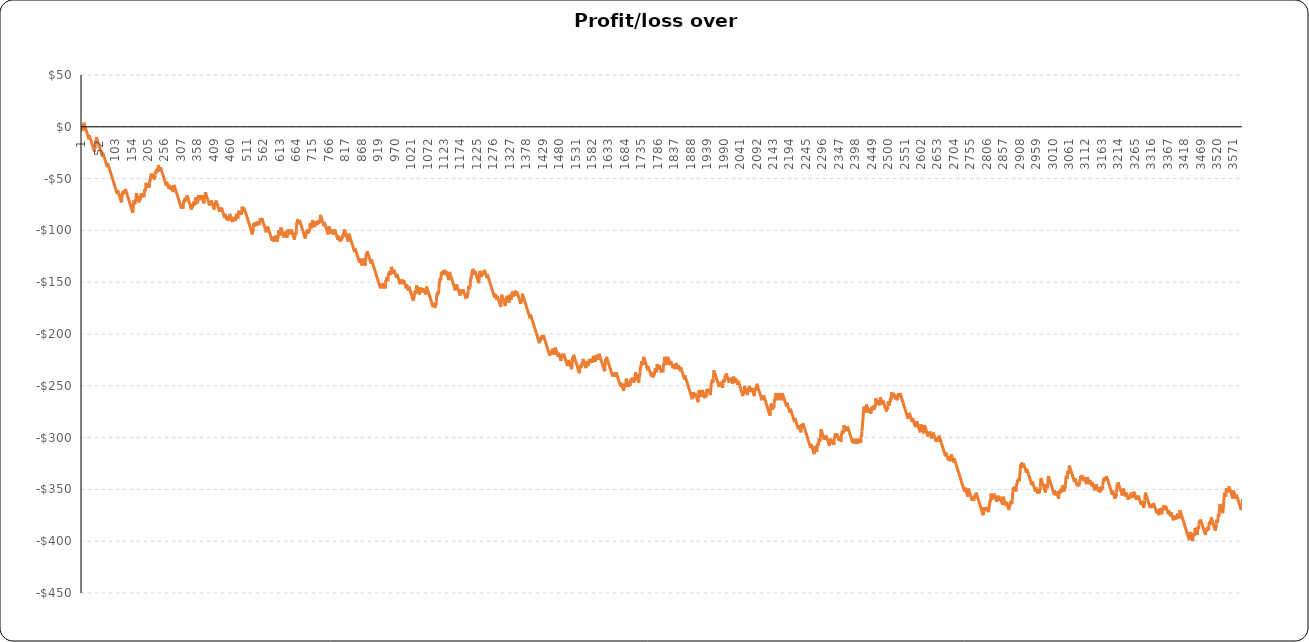
| Category | Running total  |
|---|---|
| 1.0 | -1 |
| 2.0 | -2 |
| 3.0 | -3 |
| 4.0 | -4 |
| 5.0 | 0 |
| 6.0 | 4 |
| 7.0 | 3 |
| 8.0 | 2 |
| 9.0 | 1 |
| 10.0 | 0 |
| 11.0 | -1 |
| 12.0 | -2 |
| 13.0 | -3 |
| 14.0 | -4 |
| 15.0 | -5 |
| 16.0 | -6 |
| 17.0 | -7 |
| 18.0 | -8 |
| 19.0 | -9 |
| 20.0 | -10 |
| 21.0 | -11 |
| 22.0 | -12 |
| 23.0 | -8 |
| 24.0 | -9 |
| 25.0 | -10 |
| 26.0 | -11 |
| 27.0 | -12 |
| 28.0 | -13 |
| 29.0 | -14 |
| 30.0 | -15 |
| 31.0 | -16 |
| 32.0 | -17 |
| 33.0 | -18 |
| 34.0 | -19 |
| 35.0 | -20 |
| 36.0 | -21 |
| 37.0 | -22 |
| 38.0 | -23 |
| 39.0 | -24 |
| 40.0 | -20 |
| 41.0 | -21 |
| 42.0 | -17 |
| 43.0 | -13 |
| 44.0 | -14 |
| 45.0 | -10 |
| 46.0 | -11 |
| 47.0 | -12 |
| 48.0 | -13 |
| 49.0 | -14 |
| 50.0 | -15 |
| 51.0 | -16 |
| 52.0 | -17 |
| 53.0 | -18 |
| 54.0 | -19 |
| 55.0 | -20 |
| 56.0 | -21 |
| 57.0 | -22 |
| 58.0 | -23 |
| 59.0 | -24 |
| 60.0 | -25 |
| 61.0 | -26 |
| 62.0 | -27 |
| 63.0 | -28 |
| 64.0 | -29 |
| 65.0 | -25 |
| 66.0 | -26 |
| 67.0 | -27 |
| 68.0 | -28 |
| 69.0 | -29 |
| 70.0 | -30 |
| 71.0 | -31 |
| 72.0 | -32 |
| 73.0 | -33 |
| 74.0 | -34 |
| 75.0 | -35 |
| 76.0 | -36 |
| 77.0 | -37 |
| 78.0 | -38 |
| 79.0 | -39 |
| 80.0 | -35 |
| 81.0 | -36 |
| 82.0 | -37 |
| 83.0 | -38 |
| 84.0 | -39 |
| 85.0 | -40 |
| 86.0 | -41 |
| 87.0 | -42 |
| 88.0 | -43 |
| 89.0 | -44 |
| 90.0 | -45 |
| 91.0 | -46 |
| 92.0 | -47 |
| 93.0 | -48 |
| 94.0 | -49 |
| 95.0 | -50 |
| 96.0 | -51 |
| 97.0 | -52 |
| 98.0 | -53 |
| 99.0 | -54 |
| 100.0 | -55 |
| 101.0 | -56 |
| 102.0 | -57 |
| 103.0 | -58 |
| 104.0 | -59 |
| 105.0 | -60 |
| 106.0 | -61 |
| 107.0 | -62 |
| 108.0 | -63 |
| 109.0 | -64 |
| 110.0 | -65 |
| 111.0 | -61 |
| 112.0 | -62 |
| 113.0 | -63 |
| 114.0 | -64 |
| 115.0 | -65 |
| 116.0 | -66 |
| 117.0 | -67 |
| 118.0 | -68 |
| 119.0 | -69 |
| 120.0 | -70 |
| 121.0 | -71 |
| 122.0 | -72 |
| 123.0 | -73 |
| 124.0 | -69 |
| 125.0 | -65 |
| 126.0 | -66 |
| 127.0 | -62 |
| 128.0 | -63 |
| 129.0 | -64 |
| 130.0 | -65 |
| 131.0 | -61 |
| 132.0 | -62 |
| 133.0 | -63 |
| 134.0 | -64 |
| 135.0 | -60 |
| 136.0 | -61 |
| 137.0 | -62 |
| 138.0 | -63 |
| 139.0 | -64 |
| 140.0 | -65 |
| 141.0 | -66 |
| 142.0 | -67 |
| 143.0 | -68 |
| 144.0 | -69 |
| 145.0 | -70 |
| 146.0 | -71 |
| 147.0 | -72 |
| 148.0 | -73 |
| 149.0 | -74 |
| 150.0 | -75 |
| 151.0 | -76 |
| 152.0 | -77 |
| 153.0 | -78 |
| 154.0 | -79 |
| 155.0 | -80 |
| 156.0 | -81 |
| 157.0 | -82 |
| 158.0 | -83 |
| 159.0 | -79 |
| 160.0 | -75 |
| 161.0 | -71 |
| 162.0 | -72 |
| 163.0 | -73 |
| 164.0 | -74 |
| 165.0 | -75 |
| 166.0 | -71 |
| 167.0 | -72 |
| 168.0 | -68 |
| 169.0 | -64 |
| 170.0 | -65 |
| 171.0 | -66 |
| 172.0 | -67 |
| 173.0 | -68 |
| 174.0 | -69 |
| 175.0 | -70 |
| 176.0 | -71 |
| 177.0 | -72 |
| 178.0 | -73 |
| 179.0 | -69 |
| 180.0 | -70 |
| 181.0 | -71 |
| 182.0 | -67 |
| 183.0 | -68 |
| 184.0 | -64 |
| 185.0 | -65 |
| 186.0 | -66 |
| 187.0 | -67 |
| 188.0 | -68 |
| 189.0 | -64 |
| 190.0 | -65 |
| 191.0 | -66 |
| 192.0 | -67 |
| 193.0 | -68 |
| 194.0 | -64 |
| 195.0 | -60 |
| 196.0 | -61 |
| 197.0 | -62 |
| 198.0 | -58 |
| 199.0 | -54 |
| 200.0 | -55 |
| 201.0 | -56 |
| 202.0 | -57 |
| 203.0 | -58 |
| 204.0 | -59 |
| 205.0 | -55 |
| 206.0 | -56 |
| 207.0 | -57 |
| 208.0 | -58 |
| 209.0 | -59 |
| 210.0 | -55 |
| 211.0 | -51 |
| 212.0 | -52 |
| 213.0 | -48 |
| 214.0 | -49 |
| 215.0 | -45 |
| 216.0 | -46 |
| 217.0 | -47 |
| 218.0 | -48 |
| 219.0 | -49 |
| 220.0 | -50 |
| 221.0 | -46 |
| 222.0 | -47 |
| 223.0 | -48 |
| 224.0 | -49 |
| 225.0 | -50 |
| 226.0 | -51 |
| 227.0 | -47 |
| 228.0 | -43 |
| 229.0 | -44 |
| 230.0 | -45 |
| 231.0 | -41 |
| 232.0 | -42 |
| 233.0 | -43 |
| 234.0 | -44 |
| 235.0 | -40 |
| 236.0 | -41 |
| 237.0 | -37 |
| 238.0 | -38 |
| 239.0 | -39 |
| 240.0 | -40 |
| 241.0 | -41 |
| 242.0 | -42 |
| 243.0 | -43 |
| 244.0 | -39 |
| 245.0 | -40 |
| 246.0 | -41 |
| 247.0 | -42 |
| 248.0 | -43 |
| 249.0 | -44 |
| 250.0 | -45 |
| 251.0 | -46 |
| 252.0 | -47 |
| 253.0 | -48 |
| 254.0 | -49 |
| 255.0 | -50 |
| 256.0 | -51 |
| 257.0 | -52 |
| 258.0 | -53 |
| 259.0 | -54 |
| 260.0 | -55 |
| 261.0 | -56 |
| 262.0 | -57 |
| 263.0 | -53 |
| 264.0 | -54 |
| 265.0 | -55 |
| 266.0 | -56 |
| 267.0 | -57 |
| 268.0 | -58 |
| 269.0 | -59 |
| 270.0 | -60 |
| 271.0 | -56 |
| 272.0 | -57 |
| 273.0 | -58 |
| 274.0 | -59 |
| 275.0 | -60 |
| 276.0 | -61 |
| 277.0 | -57 |
| 278.0 | -58 |
| 279.0 | -59 |
| 280.0 | -60 |
| 281.0 | -61 |
| 282.0 | -62 |
| 283.0 | -63 |
| 284.0 | -59 |
| 285.0 | -60 |
| 286.0 | -56 |
| 287.0 | -57 |
| 288.0 | -58 |
| 289.0 | -59 |
| 290.0 | -60 |
| 291.0 | -61 |
| 292.0 | -62 |
| 293.0 | -63 |
| 294.0 | -64 |
| 295.0 | -65 |
| 296.0 | -66 |
| 297.0 | -67 |
| 298.0 | -68 |
| 299.0 | -69 |
| 300.0 | -70 |
| 301.0 | -71 |
| 302.0 | -72 |
| 303.0 | -73 |
| 304.0 | -74 |
| 305.0 | -75 |
| 306.0 | -76 |
| 307.0 | -77 |
| 308.0 | -78 |
| 309.0 | -79 |
| 310.0 | -75 |
| 311.0 | -76 |
| 312.0 | -77 |
| 313.0 | -78 |
| 314.0 | -79 |
| 315.0 | -75 |
| 316.0 | -71 |
| 317.0 | -72 |
| 318.0 | -73 |
| 319.0 | -69 |
| 320.0 | -70 |
| 321.0 | -71 |
| 322.0 | -72 |
| 323.0 | -68 |
| 324.0 | -69 |
| 325.0 | -70 |
| 326.0 | -66 |
| 327.0 | -67 |
| 328.0 | -68 |
| 329.0 | -69 |
| 330.0 | -70 |
| 331.0 | -71 |
| 332.0 | -72 |
| 333.0 | -73 |
| 334.0 | -74 |
| 335.0 | -75 |
| 336.0 | -76 |
| 337.0 | -77 |
| 338.0 | -78 |
| 339.0 | -79 |
| 340.0 | -80 |
| 341.0 | -76 |
| 342.0 | -77 |
| 343.0 | -78 |
| 344.0 | -74 |
| 345.0 | -75 |
| 346.0 | -76 |
| 347.0 | -72 |
| 348.0 | -73 |
| 349.0 | -74 |
| 350.0 | -75 |
| 351.0 | -76 |
| 352.0 | -72 |
| 353.0 | -68 |
| 354.0 | -69 |
| 355.0 | -70 |
| 356.0 | -71 |
| 357.0 | -72 |
| 358.0 | -73 |
| 359.0 | -74 |
| 360.0 | -70 |
| 361.0 | -66 |
| 362.0 | -67 |
| 363.0 | -68 |
| 364.0 | -69 |
| 365.0 | -70 |
| 366.0 | -71 |
| 367.0 | -67 |
| 368.0 | -68 |
| 369.0 | -69 |
| 370.0 | -70 |
| 371.0 | -66 |
| 372.0 | -67 |
| 373.0 | -68 |
| 374.0 | -69 |
| 375.0 | -70 |
| 376.0 | -71 |
| 377.0 | -72 |
| 378.0 | -73 |
| 379.0 | -74 |
| 380.0 | -70 |
| 381.0 | -66 |
| 382.0 | -67 |
| 383.0 | -63 |
| 384.0 | -64 |
| 385.0 | -65 |
| 386.0 | -66 |
| 387.0 | -67 |
| 388.0 | -68 |
| 389.0 | -69 |
| 390.0 | -70 |
| 391.0 | -71 |
| 392.0 | -72 |
| 393.0 | -73 |
| 394.0 | -74 |
| 395.0 | -75 |
| 396.0 | -76 |
| 397.0 | -72 |
| 398.0 | -73 |
| 399.0 | -74 |
| 400.0 | -75 |
| 401.0 | -71 |
| 402.0 | -72 |
| 403.0 | -73 |
| 404.0 | -74 |
| 405.0 | -75 |
| 406.0 | -76 |
| 407.0 | -77 |
| 408.0 | -78 |
| 409.0 | -79 |
| 410.0 | -80 |
| 411.0 | -76 |
| 412.0 | -77 |
| 413.0 | -73 |
| 414.0 | -74 |
| 415.0 | -75 |
| 416.0 | -71 |
| 417.0 | -72 |
| 418.0 | -73 |
| 419.0 | -74 |
| 420.0 | -75 |
| 421.0 | -76 |
| 422.0 | -77 |
| 423.0 | -78 |
| 424.0 | -79 |
| 425.0 | -80 |
| 426.0 | -81 |
| 427.0 | -82 |
| 428.0 | -78 |
| 429.0 | -79 |
| 430.0 | -80 |
| 431.0 | -81 |
| 432.0 | -82 |
| 433.0 | -78 |
| 434.0 | -79 |
| 435.0 | -80 |
| 436.0 | -81 |
| 437.0 | -82 |
| 438.0 | -83 |
| 439.0 | -84 |
| 440.0 | -85 |
| 441.0 | -86 |
| 442.0 | -87 |
| 443.0 | -88 |
| 444.0 | -84 |
| 445.0 | -85 |
| 446.0 | -86 |
| 447.0 | -87 |
| 448.0 | -88 |
| 449.0 | -89 |
| 450.0 | -90 |
| 451.0 | -86 |
| 452.0 | -87 |
| 453.0 | -88 |
| 454.0 | -89 |
| 455.0 | -90 |
| 456.0 | -91 |
| 457.0 | -87 |
| 458.0 | -88 |
| 459.0 | -84 |
| 460.0 | -85 |
| 461.0 | -86 |
| 462.0 | -87 |
| 463.0 | -88 |
| 464.0 | -89 |
| 465.0 | -90 |
| 466.0 | -91 |
| 467.0 | -92 |
| 468.0 | -88 |
| 469.0 | -89 |
| 470.0 | -90 |
| 471.0 | -91 |
| 472.0 | -87 |
| 473.0 | -88 |
| 474.0 | -89 |
| 475.0 | -90 |
| 476.0 | -91 |
| 477.0 | -87 |
| 478.0 | -88 |
| 479.0 | -84 |
| 480.0 | -85 |
| 481.0 | -86 |
| 482.0 | -87 |
| 483.0 | -88 |
| 484.0 | -89 |
| 485.0 | -85 |
| 486.0 | -81 |
| 487.0 | -82 |
| 488.0 | -83 |
| 489.0 | -84 |
| 490.0 | -85 |
| 491.0 | -81 |
| 492.0 | -82 |
| 493.0 | -83 |
| 494.0 | -84 |
| 495.0 | -85 |
| 496.0 | -81 |
| 497.0 | -77 |
| 498.0 | -78 |
| 499.0 | -79 |
| 500.0 | -80 |
| 501.0 | -81 |
| 502.0 | -82 |
| 503.0 | -78 |
| 504.0 | -79 |
| 505.0 | -80 |
| 506.0 | -81 |
| 507.0 | -82 |
| 508.0 | -83 |
| 509.0 | -84 |
| 510.0 | -85 |
| 511.0 | -86 |
| 512.0 | -87 |
| 513.0 | -88 |
| 514.0 | -89 |
| 515.0 | -90 |
| 516.0 | -91 |
| 517.0 | -92 |
| 518.0 | -93 |
| 519.0 | -94 |
| 520.0 | -95 |
| 521.0 | -96 |
| 522.0 | -97 |
| 523.0 | -98 |
| 524.0 | -99 |
| 525.0 | -100 |
| 526.0 | -101 |
| 527.0 | -102 |
| 528.0 | -103 |
| 529.0 | -104 |
| 530.0 | -100 |
| 531.0 | -101 |
| 532.0 | -97 |
| 533.0 | -93 |
| 534.0 | -94 |
| 535.0 | -95 |
| 536.0 | -96 |
| 537.0 | -92 |
| 538.0 | -93 |
| 539.0 | -94 |
| 540.0 | -95 |
| 541.0 | -96 |
| 542.0 | -92 |
| 543.0 | -93 |
| 544.0 | -94 |
| 545.0 | -95 |
| 546.0 | -91 |
| 547.0 | -92 |
| 548.0 | -93 |
| 549.0 | -94 |
| 550.0 | -95 |
| 551.0 | -91 |
| 552.0 | -92 |
| 553.0 | -88 |
| 554.0 | -89 |
| 555.0 | -90 |
| 556.0 | -91 |
| 557.0 | -92 |
| 558.0 | -88 |
| 559.0 | -89 |
| 560.0 | -90 |
| 561.0 | -91 |
| 562.0 | -92 |
| 563.0 | -93 |
| 564.0 | -94 |
| 565.0 | -95 |
| 566.0 | -96 |
| 567.0 | -97 |
| 568.0 | -98 |
| 569.0 | -99 |
| 570.0 | -100 |
| 571.0 | -101 |
| 572.0 | -102 |
| 573.0 | -98 |
| 574.0 | -99 |
| 575.0 | -100 |
| 576.0 | -96 |
| 577.0 | -97 |
| 578.0 | -98 |
| 579.0 | -99 |
| 580.0 | -100 |
| 581.0 | -101 |
| 582.0 | -102 |
| 583.0 | -103 |
| 584.0 | -104 |
| 585.0 | -105 |
| 586.0 | -106 |
| 587.0 | -107 |
| 588.0 | -108 |
| 589.0 | -109 |
| 590.0 | -110 |
| 591.0 | -106 |
| 592.0 | -107 |
| 593.0 | -108 |
| 594.0 | -109 |
| 595.0 | -110 |
| 596.0 | -111 |
| 597.0 | -107 |
| 598.0 | -108 |
| 599.0 | -109 |
| 600.0 | -105 |
| 601.0 | -106 |
| 602.0 | -107 |
| 603.0 | -108 |
| 604.0 | -109 |
| 605.0 | -110 |
| 606.0 | -111 |
| 607.0 | -107 |
| 608.0 | -108 |
| 609.0 | -104 |
| 610.0 | -100 |
| 611.0 | -101 |
| 612.0 | -102 |
| 613.0 | -103 |
| 614.0 | -104 |
| 615.0 | -105 |
| 616.0 | -101 |
| 617.0 | -97 |
| 618.0 | -98 |
| 619.0 | -99 |
| 620.0 | -100 |
| 621.0 | -101 |
| 622.0 | -102 |
| 623.0 | -103 |
| 624.0 | -104 |
| 625.0 | -105 |
| 626.0 | -106 |
| 627.0 | -107 |
| 628.0 | -103 |
| 629.0 | -104 |
| 630.0 | -105 |
| 631.0 | -101 |
| 632.0 | -102 |
| 633.0 | -103 |
| 634.0 | -104 |
| 635.0 | -105 |
| 636.0 | -106 |
| 637.0 | -107 |
| 638.0 | -103 |
| 639.0 | -99 |
| 640.0 | -100 |
| 641.0 | -101 |
| 642.0 | -102 |
| 643.0 | -103 |
| 644.0 | -104 |
| 645.0 | -100 |
| 646.0 | -101 |
| 647.0 | -102 |
| 648.0 | -103 |
| 649.0 | -99 |
| 650.0 | -100 |
| 651.0 | -101 |
| 652.0 | -102 |
| 653.0 | -103 |
| 654.0 | -104 |
| 655.0 | -105 |
| 656.0 | -106 |
| 657.0 | -107 |
| 658.0 | -108 |
| 659.0 | -109 |
| 660.0 | -105 |
| 661.0 | -106 |
| 662.0 | -102 |
| 663.0 | -103 |
| 664.0 | -104 |
| 665.0 | -100 |
| 666.0 | -96 |
| 667.0 | -92 |
| 668.0 | -93 |
| 669.0 | -89 |
| 670.0 | -90 |
| 671.0 | -91 |
| 672.0 | -92 |
| 673.0 | -93 |
| 674.0 | -94 |
| 675.0 | -90 |
| 676.0 | -91 |
| 677.0 | -92 |
| 678.0 | -93 |
| 679.0 | -94 |
| 680.0 | -95 |
| 681.0 | -96 |
| 682.0 | -97 |
| 683.0 | -98 |
| 684.0 | -99 |
| 685.0 | -100 |
| 686.0 | -101 |
| 687.0 | -102 |
| 688.0 | -103 |
| 689.0 | -104 |
| 690.0 | -105 |
| 691.0 | -106 |
| 692.0 | -107 |
| 693.0 | -108 |
| 694.0 | -104 |
| 695.0 | -105 |
| 696.0 | -101 |
| 697.0 | -102 |
| 698.0 | -103 |
| 699.0 | -99 |
| 700.0 | -100 |
| 701.0 | -101 |
| 702.0 | -102 |
| 703.0 | -103 |
| 704.0 | -99 |
| 705.0 | -100 |
| 706.0 | -101 |
| 707.0 | -97 |
| 708.0 | -93 |
| 709.0 | -94 |
| 710.0 | -95 |
| 711.0 | -96 |
| 712.0 | -97 |
| 713.0 | -98 |
| 714.0 | -94 |
| 715.0 | -90 |
| 716.0 | -91 |
| 717.0 | -92 |
| 718.0 | -93 |
| 719.0 | -94 |
| 720.0 | -95 |
| 721.0 | -96 |
| 722.0 | -97 |
| 723.0 | -93 |
| 724.0 | -94 |
| 725.0 | -95 |
| 726.0 | -91 |
| 727.0 | -92 |
| 728.0 | -93 |
| 729.0 | -94 |
| 730.0 | -95 |
| 731.0 | -91 |
| 732.0 | -92 |
| 733.0 | -93 |
| 734.0 | -94 |
| 735.0 | -90 |
| 736.0 | -91 |
| 737.0 | -92 |
| 738.0 | -93 |
| 739.0 | -89 |
| 740.0 | -85 |
| 741.0 | -86 |
| 742.0 | -87 |
| 743.0 | -88 |
| 744.0 | -89 |
| 745.0 | -90 |
| 746.0 | -91 |
| 747.0 | -92 |
| 748.0 | -93 |
| 749.0 | -94 |
| 750.0 | -95 |
| 751.0 | -96 |
| 752.0 | -92 |
| 753.0 | -93 |
| 754.0 | -94 |
| 755.0 | -95 |
| 756.0 | -96 |
| 757.0 | -97 |
| 758.0 | -98 |
| 759.0 | -99 |
| 760.0 | -100 |
| 761.0 | -101 |
| 762.0 | -102 |
| 763.0 | -103 |
| 764.0 | -104 |
| 765.0 | -100 |
| 766.0 | -96 |
| 767.0 | -97 |
| 768.0 | -98 |
| 769.0 | -99 |
| 770.0 | -100 |
| 771.0 | -101 |
| 772.0 | -102 |
| 773.0 | -103 |
| 774.0 | -99 |
| 775.0 | -100 |
| 776.0 | -101 |
| 777.0 | -102 |
| 778.0 | -103 |
| 779.0 | -104 |
| 780.0 | -100 |
| 781.0 | -101 |
| 782.0 | -102 |
| 783.0 | -103 |
| 784.0 | -99 |
| 785.0 | -100 |
| 786.0 | -101 |
| 787.0 | -102 |
| 788.0 | -103 |
| 789.0 | -104 |
| 790.0 | -105 |
| 791.0 | -106 |
| 792.0 | -107 |
| 793.0 | -108 |
| 794.0 | -109 |
| 795.0 | -105 |
| 796.0 | -106 |
| 797.0 | -107 |
| 798.0 | -108 |
| 799.0 | -109 |
| 800.0 | -110 |
| 801.0 | -111 |
| 802.0 | -107 |
| 803.0 | -108 |
| 804.0 | -109 |
| 805.0 | -110 |
| 806.0 | -106 |
| 807.0 | -107 |
| 808.0 | -108 |
| 809.0 | -104 |
| 810.0 | -105 |
| 811.0 | -106 |
| 812.0 | -102 |
| 813.0 | -103 |
| 814.0 | -99 |
| 815.0 | -100 |
| 816.0 | -101 |
| 817.0 | -102 |
| 818.0 | -103 |
| 819.0 | -104 |
| 820.0 | -105 |
| 821.0 | -106 |
| 822.0 | -107 |
| 823.0 | -108 |
| 824.0 | -109 |
| 825.0 | -110 |
| 826.0 | -111 |
| 827.0 | -107 |
| 828.0 | -103 |
| 829.0 | -104 |
| 830.0 | -105 |
| 831.0 | -106 |
| 832.0 | -107 |
| 833.0 | -108 |
| 834.0 | -109 |
| 835.0 | -110 |
| 836.0 | -111 |
| 837.0 | -112 |
| 838.0 | -113 |
| 839.0 | -114 |
| 840.0 | -115 |
| 841.0 | -116 |
| 842.0 | -117 |
| 843.0 | -118 |
| 844.0 | -119 |
| 845.0 | -120 |
| 846.0 | -121 |
| 847.0 | -117 |
| 848.0 | -118 |
| 849.0 | -119 |
| 850.0 | -120 |
| 851.0 | -121 |
| 852.0 | -122 |
| 853.0 | -123 |
| 854.0 | -124 |
| 855.0 | -125 |
| 856.0 | -126 |
| 857.0 | -127 |
| 858.0 | -128 |
| 859.0 | -129 |
| 860.0 | -130 |
| 861.0 | -131 |
| 862.0 | -127 |
| 863.0 | -128 |
| 864.0 | -129 |
| 865.0 | -130 |
| 866.0 | -131 |
| 867.0 | -132 |
| 868.0 | -133 |
| 869.0 | -134 |
| 870.0 | -130 |
| 871.0 | -131 |
| 872.0 | -127 |
| 873.0 | -128 |
| 874.0 | -129 |
| 875.0 | -130 |
| 876.0 | -131 |
| 877.0 | -132 |
| 878.0 | -133 |
| 879.0 | -134 |
| 880.0 | -130 |
| 881.0 | -126 |
| 882.0 | -122 |
| 883.0 | -123 |
| 884.0 | -124 |
| 885.0 | -120 |
| 886.0 | -121 |
| 887.0 | -122 |
| 888.0 | -123 |
| 889.0 | -124 |
| 890.0 | -125 |
| 891.0 | -126 |
| 892.0 | -127 |
| 893.0 | -128 |
| 894.0 | -129 |
| 895.0 | -130 |
| 896.0 | -131 |
| 897.0 | -132 |
| 898.0 | -128 |
| 899.0 | -129 |
| 900.0 | -130 |
| 901.0 | -131 |
| 902.0 | -132 |
| 903.0 | -133 |
| 904.0 | -134 |
| 905.0 | -135 |
| 906.0 | -136 |
| 907.0 | -137 |
| 908.0 | -138 |
| 909.0 | -139 |
| 910.0 | -140 |
| 911.0 | -141 |
| 912.0 | -142 |
| 913.0 | -143 |
| 914.0 | -144 |
| 915.0 | -145 |
| 916.0 | -146 |
| 917.0 | -147 |
| 918.0 | -148 |
| 919.0 | -149 |
| 920.0 | -150 |
| 921.0 | -151 |
| 922.0 | -152 |
| 923.0 | -153 |
| 924.0 | -154 |
| 925.0 | -155 |
| 926.0 | -156 |
| 927.0 | -152 |
| 928.0 | -153 |
| 929.0 | -154 |
| 930.0 | -155 |
| 931.0 | -151 |
| 932.0 | -152 |
| 933.0 | -153 |
| 934.0 | -154 |
| 935.0 | -155 |
| 936.0 | -156 |
| 937.0 | -152 |
| 938.0 | -153 |
| 939.0 | -154 |
| 940.0 | -155 |
| 941.0 | -156 |
| 942.0 | -152 |
| 943.0 | -148 |
| 944.0 | -149 |
| 945.0 | -145 |
| 946.0 | -146 |
| 947.0 | -147 |
| 948.0 | -148 |
| 949.0 | -149 |
| 950.0 | -145 |
| 951.0 | -141 |
| 952.0 | -142 |
| 953.0 | -143 |
| 954.0 | -139 |
| 955.0 | -140 |
| 956.0 | -141 |
| 957.0 | -142 |
| 958.0 | -143 |
| 959.0 | -139 |
| 960.0 | -135 |
| 961.0 | -136 |
| 962.0 | -137 |
| 963.0 | -138 |
| 964.0 | -139 |
| 965.0 | -140 |
| 966.0 | -141 |
| 967.0 | -142 |
| 968.0 | -138 |
| 969.0 | -139 |
| 970.0 | -140 |
| 971.0 | -141 |
| 972.0 | -142 |
| 973.0 | -143 |
| 974.0 | -144 |
| 975.0 | -145 |
| 976.0 | -146 |
| 977.0 | -142 |
| 978.0 | -143 |
| 979.0 | -144 |
| 980.0 | -145 |
| 981.0 | -146 |
| 982.0 | -147 |
| 983.0 | -148 |
| 984.0 | -149 |
| 985.0 | -150 |
| 986.0 | -151 |
| 987.0 | -152 |
| 988.0 | -148 |
| 989.0 | -149 |
| 990.0 | -150 |
| 991.0 | -151 |
| 992.0 | -147 |
| 993.0 | -148 |
| 994.0 | -149 |
| 995.0 | -150 |
| 996.0 | -151 |
| 997.0 | -152 |
| 998.0 | -148 |
| 999.0 | -149 |
| 1000.0 | -150 |
| 1001.0 | -151 |
| 1002.0 | -152 |
| 1003.0 | -153 |
| 1004.0 | -154 |
| 1005.0 | -155 |
| 1006.0 | -156 |
| 1007.0 | -152 |
| 1008.0 | -153 |
| 1009.0 | -154 |
| 1010.0 | -155 |
| 1011.0 | -156 |
| 1012.0 | -157 |
| 1013.0 | -158 |
| 1014.0 | -154 |
| 1015.0 | -155 |
| 1016.0 | -156 |
| 1017.0 | -157 |
| 1018.0 | -158 |
| 1019.0 | -159 |
| 1020.0 | -160 |
| 1021.0 | -161 |
| 1022.0 | -162 |
| 1023.0 | -163 |
| 1024.0 | -164 |
| 1025.0 | -165 |
| 1026.0 | -166 |
| 1027.0 | -167 |
| 1028.0 | -168 |
| 1029.0 | -164 |
| 1030.0 | -165 |
| 1031.0 | -161 |
| 1032.0 | -162 |
| 1033.0 | -158 |
| 1034.0 | -159 |
| 1035.0 | -160 |
| 1036.0 | -161 |
| 1037.0 | -157 |
| 1038.0 | -153 |
| 1039.0 | -154 |
| 1040.0 | -155 |
| 1041.0 | -156 |
| 1042.0 | -157 |
| 1043.0 | -158 |
| 1044.0 | -159 |
| 1045.0 | -160 |
| 1046.0 | -161 |
| 1047.0 | -162 |
| 1048.0 | -158 |
| 1049.0 | -159 |
| 1050.0 | -155 |
| 1051.0 | -156 |
| 1052.0 | -157 |
| 1053.0 | -158 |
| 1054.0 | -159 |
| 1055.0 | -160 |
| 1056.0 | -156 |
| 1057.0 | -157 |
| 1058.0 | -158 |
| 1059.0 | -159 |
| 1060.0 | -160 |
| 1061.0 | -156 |
| 1062.0 | -157 |
| 1063.0 | -158 |
| 1064.0 | -159 |
| 1065.0 | -160 |
| 1066.0 | -161 |
| 1067.0 | -162 |
| 1068.0 | -158 |
| 1069.0 | -154 |
| 1070.0 | -155 |
| 1071.0 | -156 |
| 1072.0 | -157 |
| 1073.0 | -158 |
| 1074.0 | -159 |
| 1075.0 | -160 |
| 1076.0 | -161 |
| 1077.0 | -162 |
| 1078.0 | -163 |
| 1079.0 | -164 |
| 1080.0 | -165 |
| 1081.0 | -166 |
| 1082.0 | -167 |
| 1083.0 | -168 |
| 1084.0 | -169 |
| 1085.0 | -170 |
| 1086.0 | -171 |
| 1087.0 | -172 |
| 1088.0 | -173 |
| 1089.0 | -174 |
| 1090.0 | -170 |
| 1091.0 | -171 |
| 1092.0 | -172 |
| 1093.0 | -173 |
| 1094.0 | -174 |
| 1095.0 | -175 |
| 1096.0 | -171 |
| 1097.0 | -172 |
| 1098.0 | -173 |
| 1099.0 | -169 |
| 1100.0 | -165 |
| 1101.0 | -161 |
| 1102.0 | -162 |
| 1103.0 | -163 |
| 1104.0 | -159 |
| 1105.0 | -160 |
| 1106.0 | -161 |
| 1107.0 | -157 |
| 1108.0 | -153 |
| 1109.0 | -149 |
| 1110.0 | -150 |
| 1111.0 | -146 |
| 1112.0 | -147 |
| 1113.0 | -148 |
| 1114.0 | -144 |
| 1115.0 | -140 |
| 1116.0 | -141 |
| 1117.0 | -142 |
| 1118.0 | -143 |
| 1119.0 | -139 |
| 1120.0 | -140 |
| 1121.0 | -141 |
| 1122.0 | -142 |
| 1123.0 | -138 |
| 1124.0 | -139 |
| 1125.0 | -140 |
| 1126.0 | -141 |
| 1127.0 | -142 |
| 1128.0 | -143 |
| 1129.0 | -139 |
| 1130.0 | -140 |
| 1131.0 | -141 |
| 1132.0 | -142 |
| 1133.0 | -143 |
| 1134.0 | -144 |
| 1135.0 | -145 |
| 1136.0 | -146 |
| 1137.0 | -147 |
| 1138.0 | -148 |
| 1139.0 | -144 |
| 1140.0 | -140 |
| 1141.0 | -141 |
| 1142.0 | -142 |
| 1143.0 | -143 |
| 1144.0 | -144 |
| 1145.0 | -145 |
| 1146.0 | -146 |
| 1147.0 | -147 |
| 1148.0 | -148 |
| 1149.0 | -149 |
| 1150.0 | -150 |
| 1151.0 | -151 |
| 1152.0 | -152 |
| 1153.0 | -153 |
| 1154.0 | -154 |
| 1155.0 | -155 |
| 1156.0 | -156 |
| 1157.0 | -157 |
| 1158.0 | -158 |
| 1159.0 | -154 |
| 1160.0 | -155 |
| 1161.0 | -156 |
| 1162.0 | -152 |
| 1163.0 | -153 |
| 1164.0 | -154 |
| 1165.0 | -155 |
| 1166.0 | -156 |
| 1167.0 | -157 |
| 1168.0 | -158 |
| 1169.0 | -159 |
| 1170.0 | -160 |
| 1171.0 | -161 |
| 1172.0 | -162 |
| 1173.0 | -163 |
| 1174.0 | -159 |
| 1175.0 | -160 |
| 1176.0 | -161 |
| 1177.0 | -157 |
| 1178.0 | -158 |
| 1179.0 | -159 |
| 1180.0 | -160 |
| 1181.0 | -161 |
| 1182.0 | -157 |
| 1183.0 | -158 |
| 1184.0 | -159 |
| 1185.0 | -160 |
| 1186.0 | -161 |
| 1187.0 | -162 |
| 1188.0 | -163 |
| 1189.0 | -164 |
| 1190.0 | -165 |
| 1191.0 | -166 |
| 1192.0 | -162 |
| 1193.0 | -163 |
| 1194.0 | -164 |
| 1195.0 | -165 |
| 1196.0 | -161 |
| 1197.0 | -162 |
| 1198.0 | -158 |
| 1199.0 | -154 |
| 1200.0 | -155 |
| 1201.0 | -156 |
| 1202.0 | -157 |
| 1203.0 | -153 |
| 1204.0 | -154 |
| 1205.0 | -150 |
| 1206.0 | -146 |
| 1207.0 | -147 |
| 1208.0 | -143 |
| 1209.0 | -144 |
| 1210.0 | -140 |
| 1211.0 | -141 |
| 1212.0 | -137 |
| 1213.0 | -138 |
| 1214.0 | -139 |
| 1215.0 | -140 |
| 1216.0 | -141 |
| 1217.0 | -142 |
| 1218.0 | -143 |
| 1219.0 | -139 |
| 1220.0 | -140 |
| 1221.0 | -141 |
| 1222.0 | -142 |
| 1223.0 | -143 |
| 1224.0 | -144 |
| 1225.0 | -145 |
| 1226.0 | -146 |
| 1227.0 | -147 |
| 1228.0 | -148 |
| 1229.0 | -149 |
| 1230.0 | -150 |
| 1231.0 | -151 |
| 1232.0 | -147 |
| 1233.0 | -143 |
| 1234.0 | -139 |
| 1235.0 | -140 |
| 1236.0 | -141 |
| 1237.0 | -142 |
| 1238.0 | -143 |
| 1239.0 | -144 |
| 1240.0 | -145 |
| 1241.0 | -141 |
| 1242.0 | -142 |
| 1243.0 | -143 |
| 1244.0 | -139 |
| 1245.0 | -140 |
| 1246.0 | -141 |
| 1247.0 | -142 |
| 1248.0 | -138 |
| 1249.0 | -139 |
| 1250.0 | -140 |
| 1251.0 | -141 |
| 1252.0 | -142 |
| 1253.0 | -143 |
| 1254.0 | -144 |
| 1255.0 | -145 |
| 1256.0 | -146 |
| 1257.0 | -142 |
| 1258.0 | -143 |
| 1259.0 | -144 |
| 1260.0 | -145 |
| 1261.0 | -146 |
| 1262.0 | -147 |
| 1263.0 | -148 |
| 1264.0 | -149 |
| 1265.0 | -150 |
| 1266.0 | -151 |
| 1267.0 | -152 |
| 1268.0 | -153 |
| 1269.0 | -154 |
| 1270.0 | -155 |
| 1271.0 | -156 |
| 1272.0 | -157 |
| 1273.0 | -158 |
| 1274.0 | -159 |
| 1275.0 | -160 |
| 1276.0 | -161 |
| 1277.0 | -162 |
| 1278.0 | -163 |
| 1279.0 | -164 |
| 1280.0 | -165 |
| 1281.0 | -161 |
| 1282.0 | -162 |
| 1283.0 | -163 |
| 1284.0 | -164 |
| 1285.0 | -165 |
| 1286.0 | -166 |
| 1287.0 | -167 |
| 1288.0 | -163 |
| 1289.0 | -164 |
| 1290.0 | -165 |
| 1291.0 | -166 |
| 1292.0 | -167 |
| 1293.0 | -168 |
| 1294.0 | -169 |
| 1295.0 | -170 |
| 1296.0 | -171 |
| 1297.0 | -172 |
| 1298.0 | -173 |
| 1299.0 | -174 |
| 1300.0 | -170 |
| 1301.0 | -166 |
| 1302.0 | -162 |
| 1303.0 | -163 |
| 1304.0 | -164 |
| 1305.0 | -165 |
| 1306.0 | -166 |
| 1307.0 | -167 |
| 1308.0 | -168 |
| 1309.0 | -169 |
| 1310.0 | -170 |
| 1311.0 | -171 |
| 1312.0 | -172 |
| 1313.0 | -173 |
| 1314.0 | -169 |
| 1315.0 | -165 |
| 1316.0 | -166 |
| 1317.0 | -167 |
| 1318.0 | -163 |
| 1319.0 | -164 |
| 1320.0 | -165 |
| 1321.0 | -166 |
| 1322.0 | -167 |
| 1323.0 | -168 |
| 1324.0 | -169 |
| 1325.0 | -170 |
| 1326.0 | -166 |
| 1327.0 | -162 |
| 1328.0 | -163 |
| 1329.0 | -164 |
| 1330.0 | -165 |
| 1331.0 | -166 |
| 1332.0 | -167 |
| 1333.0 | -163 |
| 1334.0 | -159 |
| 1335.0 | -160 |
| 1336.0 | -161 |
| 1337.0 | -162 |
| 1338.0 | -163 |
| 1339.0 | -164 |
| 1340.0 | -160 |
| 1341.0 | -161 |
| 1342.0 | -162 |
| 1343.0 | -158 |
| 1344.0 | -159 |
| 1345.0 | -160 |
| 1346.0 | -161 |
| 1347.0 | -162 |
| 1348.0 | -163 |
| 1349.0 | -159 |
| 1350.0 | -160 |
| 1351.0 | -161 |
| 1352.0 | -162 |
| 1353.0 | -163 |
| 1354.0 | -164 |
| 1355.0 | -165 |
| 1356.0 | -166 |
| 1357.0 | -167 |
| 1358.0 | -168 |
| 1359.0 | -169 |
| 1360.0 | -170 |
| 1361.0 | -171 |
| 1362.0 | -167 |
| 1363.0 | -168 |
| 1364.0 | -169 |
| 1365.0 | -165 |
| 1366.0 | -161 |
| 1367.0 | -162 |
| 1368.0 | -163 |
| 1369.0 | -164 |
| 1370.0 | -165 |
| 1371.0 | -166 |
| 1372.0 | -167 |
| 1373.0 | -168 |
| 1374.0 | -169 |
| 1375.0 | -170 |
| 1376.0 | -171 |
| 1377.0 | -172 |
| 1378.0 | -173 |
| 1379.0 | -174 |
| 1380.0 | -175 |
| 1381.0 | -176 |
| 1382.0 | -177 |
| 1383.0 | -178 |
| 1384.0 | -179 |
| 1385.0 | -180 |
| 1386.0 | -181 |
| 1387.0 | -182 |
| 1388.0 | -183 |
| 1389.0 | -184 |
| 1390.0 | -185 |
| 1391.0 | -181 |
| 1392.0 | -182 |
| 1393.0 | -183 |
| 1394.0 | -184 |
| 1395.0 | -185 |
| 1396.0 | -186 |
| 1397.0 | -187 |
| 1398.0 | -188 |
| 1399.0 | -189 |
| 1400.0 | -190 |
| 1401.0 | -191 |
| 1402.0 | -192 |
| 1403.0 | -193 |
| 1404.0 | -194 |
| 1405.0 | -195 |
| 1406.0 | -196 |
| 1407.0 | -197 |
| 1408.0 | -198 |
| 1409.0 | -199 |
| 1410.0 | -200 |
| 1411.0 | -201 |
| 1412.0 | -202 |
| 1413.0 | -203 |
| 1414.0 | -204 |
| 1415.0 | -205 |
| 1416.0 | -206 |
| 1417.0 | -207 |
| 1418.0 | -208 |
| 1419.0 | -209 |
| 1420.0 | -205 |
| 1421.0 | -206 |
| 1422.0 | -207 |
| 1423.0 | -203 |
| 1424.0 | -204 |
| 1425.0 | -205 |
| 1426.0 | -201 |
| 1427.0 | -202 |
| 1428.0 | -203 |
| 1429.0 | -204 |
| 1430.0 | -205 |
| 1431.0 | -201 |
| 1432.0 | -202 |
| 1433.0 | -203 |
| 1434.0 | -204 |
| 1435.0 | -205 |
| 1436.0 | -206 |
| 1437.0 | -207 |
| 1438.0 | -208 |
| 1439.0 | -209 |
| 1440.0 | -210 |
| 1441.0 | -211 |
| 1442.0 | -212 |
| 1443.0 | -213 |
| 1444.0 | -214 |
| 1445.0 | -215 |
| 1446.0 | -216 |
| 1447.0 | -217 |
| 1448.0 | -218 |
| 1449.0 | -219 |
| 1450.0 | -220 |
| 1451.0 | -221 |
| 1452.0 | -217 |
| 1453.0 | -218 |
| 1454.0 | -219 |
| 1455.0 | -220 |
| 1456.0 | -216 |
| 1457.0 | -217 |
| 1458.0 | -218 |
| 1459.0 | -214 |
| 1460.0 | -215 |
| 1461.0 | -216 |
| 1462.0 | -217 |
| 1463.0 | -218 |
| 1464.0 | -219 |
| 1465.0 | -220 |
| 1466.0 | -216 |
| 1467.0 | -217 |
| 1468.0 | -213 |
| 1469.0 | -214 |
| 1470.0 | -215 |
| 1471.0 | -216 |
| 1472.0 | -217 |
| 1473.0 | -218 |
| 1474.0 | -219 |
| 1475.0 | -220 |
| 1476.0 | -221 |
| 1477.0 | -222 |
| 1478.0 | -218 |
| 1479.0 | -219 |
| 1480.0 | -220 |
| 1481.0 | -221 |
| 1482.0 | -222 |
| 1483.0 | -223 |
| 1484.0 | -224 |
| 1485.0 | -225 |
| 1486.0 | -226 |
| 1487.0 | -222 |
| 1488.0 | -223 |
| 1489.0 | -219 |
| 1490.0 | -220 |
| 1491.0 | -221 |
| 1492.0 | -222 |
| 1493.0 | -223 |
| 1494.0 | -219 |
| 1495.0 | -220 |
| 1496.0 | -221 |
| 1497.0 | -222 |
| 1498.0 | -223 |
| 1499.0 | -224 |
| 1500.0 | -225 |
| 1501.0 | -226 |
| 1502.0 | -227 |
| 1503.0 | -228 |
| 1504.0 | -229 |
| 1505.0 | -230 |
| 1506.0 | -231 |
| 1507.0 | -227 |
| 1508.0 | -228 |
| 1509.0 | -229 |
| 1510.0 | -225 |
| 1511.0 | -226 |
| 1512.0 | -227 |
| 1513.0 | -228 |
| 1514.0 | -229 |
| 1515.0 | -230 |
| 1516.0 | -231 |
| 1517.0 | -232 |
| 1518.0 | -233 |
| 1519.0 | -234 |
| 1520.0 | -230 |
| 1521.0 | -226 |
| 1522.0 | -222 |
| 1523.0 | -223 |
| 1524.0 | -224 |
| 1525.0 | -220 |
| 1526.0 | -221 |
| 1527.0 | -222 |
| 1528.0 | -223 |
| 1529.0 | -224 |
| 1530.0 | -225 |
| 1531.0 | -226 |
| 1532.0 | -227 |
| 1533.0 | -228 |
| 1534.0 | -229 |
| 1535.0 | -230 |
| 1536.0 | -231 |
| 1537.0 | -232 |
| 1538.0 | -233 |
| 1539.0 | -234 |
| 1540.0 | -235 |
| 1541.0 | -236 |
| 1542.0 | -237 |
| 1543.0 | -238 |
| 1544.0 | -234 |
| 1545.0 | -230 |
| 1546.0 | -231 |
| 1547.0 | -232 |
| 1548.0 | -233 |
| 1549.0 | -229 |
| 1550.0 | -230 |
| 1551.0 | -231 |
| 1552.0 | -227 |
| 1553.0 | -228 |
| 1554.0 | -224 |
| 1555.0 | -225 |
| 1556.0 | -226 |
| 1557.0 | -227 |
| 1558.0 | -228 |
| 1559.0 | -229 |
| 1560.0 | -230 |
| 1561.0 | -231 |
| 1562.0 | -232 |
| 1563.0 | -233 |
| 1564.0 | -229 |
| 1565.0 | -230 |
| 1566.0 | -226 |
| 1567.0 | -227 |
| 1568.0 | -228 |
| 1569.0 | -229 |
| 1570.0 | -230 |
| 1571.0 | -231 |
| 1572.0 | -227 |
| 1573.0 | -228 |
| 1574.0 | -224 |
| 1575.0 | -225 |
| 1576.0 | -226 |
| 1577.0 | -227 |
| 1578.0 | -228 |
| 1579.0 | -224 |
| 1580.0 | -225 |
| 1581.0 | -226 |
| 1582.0 | -227 |
| 1583.0 | -228 |
| 1584.0 | -224 |
| 1585.0 | -225 |
| 1586.0 | -221 |
| 1587.0 | -222 |
| 1588.0 | -223 |
| 1589.0 | -224 |
| 1590.0 | -225 |
| 1591.0 | -226 |
| 1592.0 | -227 |
| 1593.0 | -223 |
| 1594.0 | -224 |
| 1595.0 | -220 |
| 1596.0 | -221 |
| 1597.0 | -222 |
| 1598.0 | -223 |
| 1599.0 | -224 |
| 1600.0 | -225 |
| 1601.0 | -221 |
| 1602.0 | -222 |
| 1603.0 | -223 |
| 1604.0 | -219 |
| 1605.0 | -220 |
| 1606.0 | -221 |
| 1607.0 | -222 |
| 1608.0 | -223 |
| 1609.0 | -224 |
| 1610.0 | -225 |
| 1611.0 | -226 |
| 1612.0 | -227 |
| 1613.0 | -228 |
| 1614.0 | -229 |
| 1615.0 | -230 |
| 1616.0 | -231 |
| 1617.0 | -232 |
| 1618.0 | -233 |
| 1619.0 | -234 |
| 1620.0 | -235 |
| 1621.0 | -236 |
| 1622.0 | -232 |
| 1623.0 | -228 |
| 1624.0 | -224 |
| 1625.0 | -225 |
| 1626.0 | -226 |
| 1627.0 | -222 |
| 1628.0 | -223 |
| 1629.0 | -224 |
| 1630.0 | -225 |
| 1631.0 | -226 |
| 1632.0 | -227 |
| 1633.0 | -228 |
| 1634.0 | -229 |
| 1635.0 | -230 |
| 1636.0 | -231 |
| 1637.0 | -232 |
| 1638.0 | -233 |
| 1639.0 | -234 |
| 1640.0 | -235 |
| 1641.0 | -236 |
| 1642.0 | -237 |
| 1643.0 | -238 |
| 1644.0 | -239 |
| 1645.0 | -240 |
| 1646.0 | -241 |
| 1647.0 | -237 |
| 1648.0 | -238 |
| 1649.0 | -239 |
| 1650.0 | -240 |
| 1651.0 | -241 |
| 1652.0 | -237 |
| 1653.0 | -238 |
| 1654.0 | -239 |
| 1655.0 | -240 |
| 1656.0 | -241 |
| 1657.0 | -237 |
| 1658.0 | -238 |
| 1659.0 | -239 |
| 1660.0 | -240 |
| 1661.0 | -241 |
| 1662.0 | -242 |
| 1663.0 | -243 |
| 1664.0 | -244 |
| 1665.0 | -245 |
| 1666.0 | -246 |
| 1667.0 | -247 |
| 1668.0 | -248 |
| 1669.0 | -249 |
| 1670.0 | -250 |
| 1671.0 | -251 |
| 1672.0 | -247 |
| 1673.0 | -248 |
| 1674.0 | -249 |
| 1675.0 | -250 |
| 1676.0 | -251 |
| 1677.0 | -252 |
| 1678.0 | -253 |
| 1679.0 | -254 |
| 1680.0 | -255 |
| 1681.0 | -251 |
| 1682.0 | -252 |
| 1683.0 | -248 |
| 1684.0 | -249 |
| 1685.0 | -250 |
| 1686.0 | -251 |
| 1687.0 | -247 |
| 1688.0 | -243 |
| 1689.0 | -244 |
| 1690.0 | -245 |
| 1691.0 | -246 |
| 1692.0 | -247 |
| 1693.0 | -248 |
| 1694.0 | -249 |
| 1695.0 | -250 |
| 1696.0 | -251 |
| 1697.0 | -247 |
| 1698.0 | -248 |
| 1699.0 | -249 |
| 1700.0 | -250 |
| 1701.0 | -246 |
| 1702.0 | -247 |
| 1703.0 | -243 |
| 1704.0 | -244 |
| 1705.0 | -245 |
| 1706.0 | -246 |
| 1707.0 | -242 |
| 1708.0 | -243 |
| 1709.0 | -244 |
| 1710.0 | -245 |
| 1711.0 | -246 |
| 1712.0 | -247 |
| 1713.0 | -243 |
| 1714.0 | -244 |
| 1715.0 | -245 |
| 1716.0 | -241 |
| 1717.0 | -237 |
| 1718.0 | -238 |
| 1719.0 | -239 |
| 1720.0 | -240 |
| 1721.0 | -241 |
| 1722.0 | -242 |
| 1723.0 | -243 |
| 1724.0 | -244 |
| 1725.0 | -245 |
| 1726.0 | -246 |
| 1727.0 | -247 |
| 1728.0 | -243 |
| 1729.0 | -239 |
| 1730.0 | -240 |
| 1731.0 | -236 |
| 1732.0 | -232 |
| 1733.0 | -233 |
| 1734.0 | -229 |
| 1735.0 | -230 |
| 1736.0 | -226 |
| 1737.0 | -227 |
| 1738.0 | -228 |
| 1739.0 | -229 |
| 1740.0 | -230 |
| 1741.0 | -226 |
| 1742.0 | -222 |
| 1743.0 | -223 |
| 1744.0 | -224 |
| 1745.0 | -225 |
| 1746.0 | -226 |
| 1747.0 | -227 |
| 1748.0 | -228 |
| 1749.0 | -229 |
| 1750.0 | -230 |
| 1751.0 | -231 |
| 1752.0 | -232 |
| 1753.0 | -233 |
| 1754.0 | -234 |
| 1755.0 | -235 |
| 1756.0 | -231 |
| 1757.0 | -232 |
| 1758.0 | -233 |
| 1759.0 | -234 |
| 1760.0 | -235 |
| 1761.0 | -236 |
| 1762.0 | -237 |
| 1763.0 | -238 |
| 1764.0 | -239 |
| 1765.0 | -240 |
| 1766.0 | -241 |
| 1767.0 | -237 |
| 1768.0 | -238 |
| 1769.0 | -239 |
| 1770.0 | -240 |
| 1771.0 | -241 |
| 1772.0 | -242 |
| 1773.0 | -238 |
| 1774.0 | -239 |
| 1775.0 | -240 |
| 1776.0 | -236 |
| 1777.0 | -237 |
| 1778.0 | -233 |
| 1779.0 | -234 |
| 1780.0 | -235 |
| 1781.0 | -236 |
| 1782.0 | -237 |
| 1783.0 | -233 |
| 1784.0 | -229 |
| 1785.0 | -230 |
| 1786.0 | -231 |
| 1787.0 | -232 |
| 1788.0 | -233 |
| 1789.0 | -234 |
| 1790.0 | -230 |
| 1791.0 | -231 |
| 1792.0 | -232 |
| 1793.0 | -233 |
| 1794.0 | -234 |
| 1795.0 | -235 |
| 1796.0 | -236 |
| 1797.0 | -237 |
| 1798.0 | -233 |
| 1799.0 | -234 |
| 1800.0 | -235 |
| 1801.0 | -236 |
| 1802.0 | -237 |
| 1803.0 | -233 |
| 1804.0 | -229 |
| 1805.0 | -230 |
| 1806.0 | -226 |
| 1807.0 | -222 |
| 1808.0 | -223 |
| 1809.0 | -224 |
| 1810.0 | -225 |
| 1811.0 | -226 |
| 1812.0 | -227 |
| 1813.0 | -228 |
| 1814.0 | -229 |
| 1815.0 | -230 |
| 1816.0 | -226 |
| 1817.0 | -222 |
| 1818.0 | -223 |
| 1819.0 | -224 |
| 1820.0 | -225 |
| 1821.0 | -226 |
| 1822.0 | -227 |
| 1823.0 | -228 |
| 1824.0 | -229 |
| 1825.0 | -230 |
| 1826.0 | -226 |
| 1827.0 | -227 |
| 1828.0 | -228 |
| 1829.0 | -229 |
| 1830.0 | -230 |
| 1831.0 | -231 |
| 1832.0 | -232 |
| 1833.0 | -233 |
| 1834.0 | -229 |
| 1835.0 | -230 |
| 1836.0 | -231 |
| 1837.0 | -232 |
| 1838.0 | -233 |
| 1839.0 | -234 |
| 1840.0 | -230 |
| 1841.0 | -231 |
| 1842.0 | -232 |
| 1843.0 | -228 |
| 1844.0 | -229 |
| 1845.0 | -230 |
| 1846.0 | -231 |
| 1847.0 | -232 |
| 1848.0 | -233 |
| 1849.0 | -234 |
| 1850.0 | -230 |
| 1851.0 | -231 |
| 1852.0 | -232 |
| 1853.0 | -233 |
| 1854.0 | -234 |
| 1855.0 | -235 |
| 1856.0 | -236 |
| 1857.0 | -232 |
| 1858.0 | -233 |
| 1859.0 | -234 |
| 1860.0 | -235 |
| 1861.0 | -236 |
| 1862.0 | -237 |
| 1863.0 | -238 |
| 1864.0 | -239 |
| 1865.0 | -240 |
| 1866.0 | -241 |
| 1867.0 | -242 |
| 1868.0 | -243 |
| 1869.0 | -244 |
| 1870.0 | -240 |
| 1871.0 | -241 |
| 1872.0 | -242 |
| 1873.0 | -243 |
| 1874.0 | -244 |
| 1875.0 | -245 |
| 1876.0 | -246 |
| 1877.0 | -247 |
| 1878.0 | -248 |
| 1879.0 | -249 |
| 1880.0 | -250 |
| 1881.0 | -251 |
| 1882.0 | -252 |
| 1883.0 | -253 |
| 1884.0 | -254 |
| 1885.0 | -255 |
| 1886.0 | -256 |
| 1887.0 | -257 |
| 1888.0 | -258 |
| 1889.0 | -259 |
| 1890.0 | -260 |
| 1891.0 | -261 |
| 1892.0 | -262 |
| 1893.0 | -263 |
| 1894.0 | -259 |
| 1895.0 | -260 |
| 1896.0 | -256 |
| 1897.0 | -257 |
| 1898.0 | -258 |
| 1899.0 | -259 |
| 1900.0 | -260 |
| 1901.0 | -261 |
| 1902.0 | -257 |
| 1903.0 | -258 |
| 1904.0 | -259 |
| 1905.0 | -260 |
| 1906.0 | -261 |
| 1907.0 | -262 |
| 1908.0 | -263 |
| 1909.0 | -264 |
| 1910.0 | -265 |
| 1911.0 | -266 |
| 1912.0 | -262 |
| 1913.0 | -258 |
| 1914.0 | -254 |
| 1915.0 | -255 |
| 1916.0 | -256 |
| 1917.0 | -257 |
| 1918.0 | -258 |
| 1919.0 | -259 |
| 1920.0 | -260 |
| 1921.0 | -261 |
| 1922.0 | -257 |
| 1923.0 | -258 |
| 1924.0 | -254 |
| 1925.0 | -255 |
| 1926.0 | -256 |
| 1927.0 | -257 |
| 1928.0 | -258 |
| 1929.0 | -259 |
| 1930.0 | -260 |
| 1931.0 | -261 |
| 1932.0 | -262 |
| 1933.0 | -258 |
| 1934.0 | -259 |
| 1935.0 | -260 |
| 1936.0 | -261 |
| 1937.0 | -257 |
| 1938.0 | -253 |
| 1939.0 | -254 |
| 1940.0 | -255 |
| 1941.0 | -256 |
| 1942.0 | -257 |
| 1943.0 | -253 |
| 1944.0 | -254 |
| 1945.0 | -255 |
| 1946.0 | -256 |
| 1947.0 | -257 |
| 1948.0 | -258 |
| 1949.0 | -259 |
| 1950.0 | -255 |
| 1951.0 | -251 |
| 1952.0 | -247 |
| 1953.0 | -248 |
| 1954.0 | -244 |
| 1955.0 | -245 |
| 1956.0 | -246 |
| 1957.0 | -247 |
| 1958.0 | -243 |
| 1959.0 | -239 |
| 1960.0 | -235 |
| 1961.0 | -236 |
| 1962.0 | -237 |
| 1963.0 | -238 |
| 1964.0 | -239 |
| 1965.0 | -240 |
| 1966.0 | -241 |
| 1967.0 | -242 |
| 1968.0 | -243 |
| 1969.0 | -244 |
| 1970.0 | -245 |
| 1971.0 | -246 |
| 1972.0 | -247 |
| 1973.0 | -248 |
| 1974.0 | -249 |
| 1975.0 | -250 |
| 1976.0 | -251 |
| 1977.0 | -247 |
| 1978.0 | -248 |
| 1979.0 | -249 |
| 1980.0 | -250 |
| 1981.0 | -246 |
| 1982.0 | -247 |
| 1983.0 | -248 |
| 1984.0 | -249 |
| 1985.0 | -250 |
| 1986.0 | -251 |
| 1987.0 | -252 |
| 1988.0 | -248 |
| 1989.0 | -244 |
| 1990.0 | -245 |
| 1991.0 | -246 |
| 1992.0 | -247 |
| 1993.0 | -243 |
| 1994.0 | -244 |
| 1995.0 | -240 |
| 1996.0 | -241 |
| 1997.0 | -242 |
| 1998.0 | -238 |
| 1999.0 | -239 |
| 2000.0 | -240 |
| 2001.0 | -241 |
| 2002.0 | -242 |
| 2003.0 | -243 |
| 2004.0 | -244 |
| 2005.0 | -245 |
| 2006.0 | -246 |
| 2007.0 | -247 |
| 2008.0 | -243 |
| 2009.0 | -244 |
| 2010.0 | -245 |
| 2011.0 | -246 |
| 2012.0 | -242 |
| 2013.0 | -243 |
| 2014.0 | -244 |
| 2015.0 | -245 |
| 2016.0 | -246 |
| 2017.0 | -247 |
| 2018.0 | -248 |
| 2019.0 | -244 |
| 2020.0 | -245 |
| 2021.0 | -241 |
| 2022.0 | -242 |
| 2023.0 | -243 |
| 2024.0 | -244 |
| 2025.0 | -245 |
| 2026.0 | -246 |
| 2027.0 | -247 |
| 2028.0 | -243 |
| 2029.0 | -244 |
| 2030.0 | -245 |
| 2031.0 | -246 |
| 2032.0 | -247 |
| 2033.0 | -248 |
| 2034.0 | -249 |
| 2035.0 | -245 |
| 2036.0 | -246 |
| 2037.0 | -247 |
| 2038.0 | -248 |
| 2039.0 | -249 |
| 2040.0 | -250 |
| 2041.0 | -251 |
| 2042.0 | -252 |
| 2043.0 | -253 |
| 2044.0 | -254 |
| 2045.0 | -255 |
| 2046.0 | -256 |
| 2047.0 | -257 |
| 2048.0 | -258 |
| 2049.0 | -259 |
| 2050.0 | -260 |
| 2051.0 | -256 |
| 2052.0 | -257 |
| 2053.0 | -258 |
| 2054.0 | -254 |
| 2055.0 | -250 |
| 2056.0 | -251 |
| 2057.0 | -252 |
| 2058.0 | -253 |
| 2059.0 | -254 |
| 2060.0 | -255 |
| 2061.0 | -256 |
| 2062.0 | -257 |
| 2063.0 | -258 |
| 2064.0 | -259 |
| 2065.0 | -255 |
| 2066.0 | -256 |
| 2067.0 | -252 |
| 2068.0 | -253 |
| 2069.0 | -254 |
| 2070.0 | -250 |
| 2071.0 | -251 |
| 2072.0 | -252 |
| 2073.0 | -253 |
| 2074.0 | -254 |
| 2075.0 | -255 |
| 2076.0 | -256 |
| 2077.0 | -252 |
| 2078.0 | -253 |
| 2079.0 | -254 |
| 2080.0 | -255 |
| 2081.0 | -256 |
| 2082.0 | -257 |
| 2083.0 | -258 |
| 2084.0 | -259 |
| 2085.0 | -260 |
| 2086.0 | -256 |
| 2087.0 | -252 |
| 2088.0 | -253 |
| 2089.0 | -254 |
| 2090.0 | -255 |
| 2091.0 | -251 |
| 2092.0 | -252 |
| 2093.0 | -248 |
| 2094.0 | -249 |
| 2095.0 | -250 |
| 2096.0 | -251 |
| 2097.0 | -252 |
| 2098.0 | -253 |
| 2099.0 | -254 |
| 2100.0 | -255 |
| 2101.0 | -256 |
| 2102.0 | -257 |
| 2103.0 | -258 |
| 2104.0 | -259 |
| 2105.0 | -260 |
| 2106.0 | -261 |
| 2107.0 | -262 |
| 2108.0 | -263 |
| 2109.0 | -264 |
| 2110.0 | -260 |
| 2111.0 | -261 |
| 2112.0 | -262 |
| 2113.0 | -263 |
| 2114.0 | -259 |
| 2115.0 | -260 |
| 2116.0 | -261 |
| 2117.0 | -262 |
| 2118.0 | -263 |
| 2119.0 | -264 |
| 2120.0 | -265 |
| 2121.0 | -266 |
| 2122.0 | -267 |
| 2123.0 | -268 |
| 2124.0 | -269 |
| 2125.0 | -270 |
| 2126.0 | -271 |
| 2127.0 | -272 |
| 2128.0 | -273 |
| 2129.0 | -274 |
| 2130.0 | -275 |
| 2131.0 | -276 |
| 2132.0 | -277 |
| 2133.0 | -278 |
| 2134.0 | -279 |
| 2135.0 | -275 |
| 2136.0 | -271 |
| 2137.0 | -267 |
| 2138.0 | -268 |
| 2139.0 | -269 |
| 2140.0 | -270 |
| 2141.0 | -271 |
| 2142.0 | -272 |
| 2143.0 | -273 |
| 2144.0 | -269 |
| 2145.0 | -270 |
| 2146.0 | -271 |
| 2147.0 | -267 |
| 2148.0 | -263 |
| 2149.0 | -264 |
| 2150.0 | -260 |
| 2151.0 | -261 |
| 2152.0 | -257 |
| 2153.0 | -258 |
| 2154.0 | -259 |
| 2155.0 | -260 |
| 2156.0 | -261 |
| 2157.0 | -262 |
| 2158.0 | -263 |
| 2159.0 | -264 |
| 2160.0 | -260 |
| 2161.0 | -261 |
| 2162.0 | -257 |
| 2163.0 | -258 |
| 2164.0 | -259 |
| 2165.0 | -260 |
| 2166.0 | -261 |
| 2167.0 | -262 |
| 2168.0 | -263 |
| 2169.0 | -264 |
| 2170.0 | -260 |
| 2171.0 | -261 |
| 2172.0 | -257 |
| 2173.0 | -258 |
| 2174.0 | -259 |
| 2175.0 | -260 |
| 2176.0 | -261 |
| 2177.0 | -262 |
| 2178.0 | -263 |
| 2179.0 | -264 |
| 2180.0 | -265 |
| 2181.0 | -266 |
| 2182.0 | -267 |
| 2183.0 | -268 |
| 2184.0 | -269 |
| 2185.0 | -270 |
| 2186.0 | -266 |
| 2187.0 | -267 |
| 2188.0 | -268 |
| 2189.0 | -269 |
| 2190.0 | -270 |
| 2191.0 | -271 |
| 2192.0 | -272 |
| 2193.0 | -273 |
| 2194.0 | -274 |
| 2195.0 | -275 |
| 2196.0 | -276 |
| 2197.0 | -272 |
| 2198.0 | -273 |
| 2199.0 | -274 |
| 2200.0 | -275 |
| 2201.0 | -276 |
| 2202.0 | -277 |
| 2203.0 | -278 |
| 2204.0 | -279 |
| 2205.0 | -280 |
| 2206.0 | -281 |
| 2207.0 | -282 |
| 2208.0 | -283 |
| 2209.0 | -284 |
| 2210.0 | -285 |
| 2211.0 | -281 |
| 2212.0 | -282 |
| 2213.0 | -283 |
| 2214.0 | -284 |
| 2215.0 | -285 |
| 2216.0 | -286 |
| 2217.0 | -287 |
| 2218.0 | -288 |
| 2219.0 | -289 |
| 2220.0 | -290 |
| 2221.0 | -291 |
| 2222.0 | -292 |
| 2223.0 | -288 |
| 2224.0 | -289 |
| 2225.0 | -290 |
| 2226.0 | -291 |
| 2227.0 | -292 |
| 2228.0 | -293 |
| 2229.0 | -294 |
| 2230.0 | -295 |
| 2231.0 | -291 |
| 2232.0 | -287 |
| 2233.0 | -288 |
| 2234.0 | -289 |
| 2235.0 | -290 |
| 2236.0 | -286 |
| 2237.0 | -287 |
| 2238.0 | -288 |
| 2239.0 | -289 |
| 2240.0 | -290 |
| 2241.0 | -291 |
| 2242.0 | -292 |
| 2243.0 | -293 |
| 2244.0 | -294 |
| 2245.0 | -295 |
| 2246.0 | -296 |
| 2247.0 | -297 |
| 2248.0 | -298 |
| 2249.0 | -299 |
| 2250.0 | -300 |
| 2251.0 | -301 |
| 2252.0 | -302 |
| 2253.0 | -303 |
| 2254.0 | -304 |
| 2255.0 | -305 |
| 2256.0 | -306 |
| 2257.0 | -307 |
| 2258.0 | -308 |
| 2259.0 | -309 |
| 2260.0 | -310 |
| 2261.0 | -306 |
| 2262.0 | -307 |
| 2263.0 | -308 |
| 2264.0 | -309 |
| 2265.0 | -310 |
| 2266.0 | -311 |
| 2267.0 | -312 |
| 2268.0 | -313 |
| 2269.0 | -314 |
| 2270.0 | -315 |
| 2271.0 | -316 |
| 2272.0 | -312 |
| 2273.0 | -308 |
| 2274.0 | -309 |
| 2275.0 | -310 |
| 2276.0 | -311 |
| 2277.0 | -312 |
| 2278.0 | -313 |
| 2279.0 | -314 |
| 2280.0 | -310 |
| 2281.0 | -306 |
| 2282.0 | -307 |
| 2283.0 | -308 |
| 2284.0 | -304 |
| 2285.0 | -305 |
| 2286.0 | -301 |
| 2287.0 | -302 |
| 2288.0 | -303 |
| 2289.0 | -304 |
| 2290.0 | -300 |
| 2291.0 | -296 |
| 2292.0 | -292 |
| 2293.0 | -293 |
| 2294.0 | -294 |
| 2295.0 | -295 |
| 2296.0 | -296 |
| 2297.0 | -297 |
| 2298.0 | -298 |
| 2299.0 | -299 |
| 2300.0 | -300 |
| 2301.0 | -301 |
| 2302.0 | -302 |
| 2303.0 | -298 |
| 2304.0 | -299 |
| 2305.0 | -300 |
| 2306.0 | -301 |
| 2307.0 | -302 |
| 2308.0 | -298 |
| 2309.0 | -299 |
| 2310.0 | -300 |
| 2311.0 | -301 |
| 2312.0 | -302 |
| 2313.0 | -303 |
| 2314.0 | -304 |
| 2315.0 | -305 |
| 2316.0 | -306 |
| 2317.0 | -307 |
| 2318.0 | -308 |
| 2319.0 | -304 |
| 2320.0 | -305 |
| 2321.0 | -301 |
| 2322.0 | -302 |
| 2323.0 | -303 |
| 2324.0 | -304 |
| 2325.0 | -305 |
| 2326.0 | -306 |
| 2327.0 | -302 |
| 2328.0 | -303 |
| 2329.0 | -304 |
| 2330.0 | -305 |
| 2331.0 | -306 |
| 2332.0 | -307 |
| 2333.0 | -303 |
| 2334.0 | -299 |
| 2335.0 | -300 |
| 2336.0 | -296 |
| 2337.0 | -297 |
| 2338.0 | -298 |
| 2339.0 | -299 |
| 2340.0 | -300 |
| 2341.0 | -296 |
| 2342.0 | -297 |
| 2343.0 | -298 |
| 2344.0 | -299 |
| 2345.0 | -300 |
| 2346.0 | -301 |
| 2347.0 | -302 |
| 2348.0 | -303 |
| 2349.0 | -299 |
| 2350.0 | -300 |
| 2351.0 | -301 |
| 2352.0 | -302 |
| 2353.0 | -303 |
| 2354.0 | -304 |
| 2355.0 | -300 |
| 2356.0 | -296 |
| 2357.0 | -297 |
| 2358.0 | -293 |
| 2359.0 | -294 |
| 2360.0 | -295 |
| 2361.0 | -296 |
| 2362.0 | -292 |
| 2363.0 | -288 |
| 2364.0 | -289 |
| 2365.0 | -290 |
| 2366.0 | -291 |
| 2367.0 | -292 |
| 2368.0 | -293 |
| 2369.0 | -294 |
| 2370.0 | -290 |
| 2371.0 | -291 |
| 2372.0 | -292 |
| 2373.0 | -293 |
| 2374.0 | -289 |
| 2375.0 | -290 |
| 2376.0 | -291 |
| 2377.0 | -292 |
| 2378.0 | -293 |
| 2379.0 | -294 |
| 2380.0 | -295 |
| 2381.0 | -296 |
| 2382.0 | -297 |
| 2383.0 | -298 |
| 2384.0 | -299 |
| 2385.0 | -300 |
| 2386.0 | -301 |
| 2387.0 | -302 |
| 2388.0 | -303 |
| 2389.0 | -304 |
| 2390.0 | -305 |
| 2391.0 | -301 |
| 2392.0 | -302 |
| 2393.0 | -303 |
| 2394.0 | -304 |
| 2395.0 | -305 |
| 2396.0 | -306 |
| 2397.0 | -302 |
| 2398.0 | -303 |
| 2399.0 | -304 |
| 2400.0 | -305 |
| 2401.0 | -301 |
| 2402.0 | -302 |
| 2403.0 | -303 |
| 2404.0 | -304 |
| 2405.0 | -305 |
| 2406.0 | -306 |
| 2407.0 | -302 |
| 2408.0 | -303 |
| 2409.0 | -304 |
| 2410.0 | -305 |
| 2411.0 | -301 |
| 2412.0 | -302 |
| 2413.0 | -303 |
| 2414.0 | -304 |
| 2415.0 | -305 |
| 2416.0 | -301 |
| 2417.0 | -297 |
| 2418.0 | -298 |
| 2419.0 | -294 |
| 2420.0 | -290 |
| 2421.0 | -286 |
| 2422.0 | -282 |
| 2423.0 | -278 |
| 2424.0 | -274 |
| 2425.0 | -270 |
| 2426.0 | -271 |
| 2427.0 | -272 |
| 2428.0 | -273 |
| 2429.0 | -274 |
| 2430.0 | -275 |
| 2431.0 | -276 |
| 2432.0 | -272 |
| 2433.0 | -268 |
| 2434.0 | -269 |
| 2435.0 | -270 |
| 2436.0 | -271 |
| 2437.0 | -272 |
| 2438.0 | -273 |
| 2439.0 | -274 |
| 2440.0 | -275 |
| 2441.0 | -276 |
| 2442.0 | -272 |
| 2443.0 | -273 |
| 2444.0 | -274 |
| 2445.0 | -275 |
| 2446.0 | -276 |
| 2447.0 | -277 |
| 2448.0 | -273 |
| 2449.0 | -274 |
| 2450.0 | -270 |
| 2451.0 | -271 |
| 2452.0 | -272 |
| 2453.0 | -273 |
| 2454.0 | -269 |
| 2455.0 | -270 |
| 2456.0 | -271 |
| 2457.0 | -272 |
| 2458.0 | -273 |
| 2459.0 | -269 |
| 2460.0 | -270 |
| 2461.0 | -266 |
| 2462.0 | -262 |
| 2463.0 | -263 |
| 2464.0 | -264 |
| 2465.0 | -265 |
| 2466.0 | -266 |
| 2467.0 | -267 |
| 2468.0 | -268 |
| 2469.0 | -264 |
| 2470.0 | -265 |
| 2471.0 | -266 |
| 2472.0 | -267 |
| 2473.0 | -268 |
| 2474.0 | -269 |
| 2475.0 | -265 |
| 2476.0 | -261 |
| 2477.0 | -262 |
| 2478.0 | -263 |
| 2479.0 | -264 |
| 2480.0 | -265 |
| 2481.0 | -266 |
| 2482.0 | -267 |
| 2483.0 | -268 |
| 2484.0 | -264 |
| 2485.0 | -265 |
| 2486.0 | -266 |
| 2487.0 | -267 |
| 2488.0 | -268 |
| 2489.0 | -269 |
| 2490.0 | -270 |
| 2491.0 | -271 |
| 2492.0 | -272 |
| 2493.0 | -273 |
| 2494.0 | -274 |
| 2495.0 | -275 |
| 2496.0 | -271 |
| 2497.0 | -272 |
| 2498.0 | -273 |
| 2499.0 | -269 |
| 2500.0 | -265 |
| 2501.0 | -266 |
| 2502.0 | -267 |
| 2503.0 | -268 |
| 2504.0 | -269 |
| 2505.0 | -265 |
| 2506.0 | -266 |
| 2507.0 | -262 |
| 2508.0 | -263 |
| 2509.0 | -264 |
| 2510.0 | -260 |
| 2511.0 | -256 |
| 2512.0 | -257 |
| 2513.0 | -258 |
| 2514.0 | -259 |
| 2515.0 | -260 |
| 2516.0 | -261 |
| 2517.0 | -257 |
| 2518.0 | -258 |
| 2519.0 | -259 |
| 2520.0 | -260 |
| 2521.0 | -261 |
| 2522.0 | -262 |
| 2523.0 | -263 |
| 2524.0 | -259 |
| 2525.0 | -260 |
| 2526.0 | -261 |
| 2527.0 | -262 |
| 2528.0 | -263 |
| 2529.0 | -264 |
| 2530.0 | -260 |
| 2531.0 | -261 |
| 2532.0 | -257 |
| 2533.0 | -258 |
| 2534.0 | -259 |
| 2535.0 | -260 |
| 2536.0 | -261 |
| 2537.0 | -257 |
| 2538.0 | -258 |
| 2539.0 | -259 |
| 2540.0 | -260 |
| 2541.0 | -261 |
| 2542.0 | -262 |
| 2543.0 | -263 |
| 2544.0 | -264 |
| 2545.0 | -265 |
| 2546.0 | -266 |
| 2547.0 | -267 |
| 2548.0 | -268 |
| 2549.0 | -269 |
| 2550.0 | -270 |
| 2551.0 | -271 |
| 2552.0 | -272 |
| 2553.0 | -273 |
| 2554.0 | -274 |
| 2555.0 | -275 |
| 2556.0 | -276 |
| 2557.0 | -277 |
| 2558.0 | -278 |
| 2559.0 | -279 |
| 2560.0 | -280 |
| 2561.0 | -281 |
| 2562.0 | -282 |
| 2563.0 | -278 |
| 2564.0 | -279 |
| 2565.0 | -280 |
| 2566.0 | -276 |
| 2567.0 | -277 |
| 2568.0 | -278 |
| 2569.0 | -279 |
| 2570.0 | -280 |
| 2571.0 | -281 |
| 2572.0 | -282 |
| 2573.0 | -283 |
| 2574.0 | -284 |
| 2575.0 | -285 |
| 2576.0 | -281 |
| 2577.0 | -282 |
| 2578.0 | -283 |
| 2579.0 | -284 |
| 2580.0 | -285 |
| 2581.0 | -286 |
| 2582.0 | -287 |
| 2583.0 | -288 |
| 2584.0 | -289 |
| 2585.0 | -290 |
| 2586.0 | -286 |
| 2587.0 | -287 |
| 2588.0 | -288 |
| 2589.0 | -284 |
| 2590.0 | -285 |
| 2591.0 | -286 |
| 2592.0 | -287 |
| 2593.0 | -288 |
| 2594.0 | -289 |
| 2595.0 | -290 |
| 2596.0 | -291 |
| 2597.0 | -292 |
| 2598.0 | -293 |
| 2599.0 | -294 |
| 2600.0 | -295 |
| 2601.0 | -291 |
| 2602.0 | -287 |
| 2603.0 | -288 |
| 2604.0 | -289 |
| 2605.0 | -290 |
| 2606.0 | -291 |
| 2607.0 | -292 |
| 2608.0 | -293 |
| 2609.0 | -294 |
| 2610.0 | -295 |
| 2611.0 | -296 |
| 2612.0 | -292 |
| 2613.0 | -288 |
| 2614.0 | -289 |
| 2615.0 | -290 |
| 2616.0 | -291 |
| 2617.0 | -292 |
| 2618.0 | -293 |
| 2619.0 | -294 |
| 2620.0 | -295 |
| 2621.0 | -296 |
| 2622.0 | -297 |
| 2623.0 | -298 |
| 2624.0 | -299 |
| 2625.0 | -295 |
| 2626.0 | -296 |
| 2627.0 | -297 |
| 2628.0 | -298 |
| 2629.0 | -294 |
| 2630.0 | -295 |
| 2631.0 | -296 |
| 2632.0 | -297 |
| 2633.0 | -298 |
| 2634.0 | -299 |
| 2635.0 | -300 |
| 2636.0 | -301 |
| 2637.0 | -297 |
| 2638.0 | -298 |
| 2639.0 | -299 |
| 2640.0 | -295 |
| 2641.0 | -296 |
| 2642.0 | -297 |
| 2643.0 | -298 |
| 2644.0 | -299 |
| 2645.0 | -300 |
| 2646.0 | -301 |
| 2647.0 | -302 |
| 2648.0 | -303 |
| 2649.0 | -304 |
| 2650.0 | -300 |
| 2651.0 | -301 |
| 2652.0 | -302 |
| 2653.0 | -303 |
| 2654.0 | -304 |
| 2655.0 | -300 |
| 2656.0 | -301 |
| 2657.0 | -302 |
| 2658.0 | -298 |
| 2659.0 | -299 |
| 2660.0 | -300 |
| 2661.0 | -301 |
| 2662.0 | -302 |
| 2663.0 | -303 |
| 2664.0 | -304 |
| 2665.0 | -305 |
| 2666.0 | -306 |
| 2667.0 | -307 |
| 2668.0 | -308 |
| 2669.0 | -309 |
| 2670.0 | -310 |
| 2671.0 | -311 |
| 2672.0 | -312 |
| 2673.0 | -313 |
| 2674.0 | -314 |
| 2675.0 | -315 |
| 2676.0 | -316 |
| 2677.0 | -317 |
| 2678.0 | -318 |
| 2679.0 | -314 |
| 2680.0 | -315 |
| 2681.0 | -316 |
| 2682.0 | -317 |
| 2683.0 | -318 |
| 2684.0 | -319 |
| 2685.0 | -320 |
| 2686.0 | -321 |
| 2687.0 | -322 |
| 2688.0 | -318 |
| 2689.0 | -319 |
| 2690.0 | -320 |
| 2691.0 | -321 |
| 2692.0 | -322 |
| 2693.0 | -323 |
| 2694.0 | -319 |
| 2695.0 | -320 |
| 2696.0 | -316 |
| 2697.0 | -317 |
| 2698.0 | -318 |
| 2699.0 | -319 |
| 2700.0 | -320 |
| 2701.0 | -321 |
| 2702.0 | -322 |
| 2703.0 | -323 |
| 2704.0 | -324 |
| 2705.0 | -320 |
| 2706.0 | -321 |
| 2707.0 | -322 |
| 2708.0 | -323 |
| 2709.0 | -324 |
| 2710.0 | -325 |
| 2711.0 | -326 |
| 2712.0 | -327 |
| 2713.0 | -328 |
| 2714.0 | -329 |
| 2715.0 | -330 |
| 2716.0 | -331 |
| 2717.0 | -332 |
| 2718.0 | -333 |
| 2719.0 | -334 |
| 2720.0 | -335 |
| 2721.0 | -336 |
| 2722.0 | -337 |
| 2723.0 | -338 |
| 2724.0 | -339 |
| 2725.0 | -340 |
| 2726.0 | -341 |
| 2727.0 | -342 |
| 2728.0 | -343 |
| 2729.0 | -344 |
| 2730.0 | -345 |
| 2731.0 | -346 |
| 2732.0 | -347 |
| 2733.0 | -348 |
| 2734.0 | -349 |
| 2735.0 | -350 |
| 2736.0 | -351 |
| 2737.0 | -352 |
| 2738.0 | -348 |
| 2739.0 | -349 |
| 2740.0 | -350 |
| 2741.0 | -351 |
| 2742.0 | -352 |
| 2743.0 | -353 |
| 2744.0 | -354 |
| 2745.0 | -355 |
| 2746.0 | -356 |
| 2747.0 | -357 |
| 2748.0 | -353 |
| 2749.0 | -349 |
| 2750.0 | -350 |
| 2751.0 | -351 |
| 2752.0 | -352 |
| 2753.0 | -353 |
| 2754.0 | -354 |
| 2755.0 | -355 |
| 2756.0 | -356 |
| 2757.0 | -357 |
| 2758.0 | -358 |
| 2759.0 | -359 |
| 2760.0 | -360 |
| 2761.0 | -361 |
| 2762.0 | -357 |
| 2763.0 | -358 |
| 2764.0 | -359 |
| 2765.0 | -360 |
| 2766.0 | -361 |
| 2767.0 | -357 |
| 2768.0 | -358 |
| 2769.0 | -359 |
| 2770.0 | -355 |
| 2771.0 | -356 |
| 2772.0 | -357 |
| 2773.0 | -353 |
| 2774.0 | -354 |
| 2775.0 | -355 |
| 2776.0 | -356 |
| 2777.0 | -357 |
| 2778.0 | -358 |
| 2779.0 | -359 |
| 2780.0 | -360 |
| 2781.0 | -361 |
| 2782.0 | -362 |
| 2783.0 | -363 |
| 2784.0 | -364 |
| 2785.0 | -365 |
| 2786.0 | -366 |
| 2787.0 | -367 |
| 2788.0 | -368 |
| 2789.0 | -369 |
| 2790.0 | -370 |
| 2791.0 | -371 |
| 2792.0 | -372 |
| 2793.0 | -373 |
| 2794.0 | -374 |
| 2795.0 | -375 |
| 2796.0 | -371 |
| 2797.0 | -367 |
| 2798.0 | -368 |
| 2799.0 | -369 |
| 2800.0 | -370 |
| 2801.0 | -371 |
| 2802.0 | -367 |
| 2803.0 | -368 |
| 2804.0 | -369 |
| 2805.0 | -370 |
| 2806.0 | -371 |
| 2807.0 | -367 |
| 2808.0 | -368 |
| 2809.0 | -369 |
| 2810.0 | -370 |
| 2811.0 | -371 |
| 2812.0 | -372 |
| 2813.0 | -368 |
| 2814.0 | -364 |
| 2815.0 | -365 |
| 2816.0 | -361 |
| 2817.0 | -362 |
| 2818.0 | -358 |
| 2819.0 | -354 |
| 2820.0 | -355 |
| 2821.0 | -356 |
| 2822.0 | -357 |
| 2823.0 | -358 |
| 2824.0 | -359 |
| 2825.0 | -360 |
| 2826.0 | -356 |
| 2827.0 | -357 |
| 2828.0 | -358 |
| 2829.0 | -354 |
| 2830.0 | -355 |
| 2831.0 | -356 |
| 2832.0 | -357 |
| 2833.0 | -358 |
| 2834.0 | -359 |
| 2835.0 | -360 |
| 2836.0 | -361 |
| 2837.0 | -362 |
| 2838.0 | -358 |
| 2839.0 | -359 |
| 2840.0 | -360 |
| 2841.0 | -356 |
| 2842.0 | -357 |
| 2843.0 | -358 |
| 2844.0 | -359 |
| 2845.0 | -360 |
| 2846.0 | -361 |
| 2847.0 | -357 |
| 2848.0 | -358 |
| 2849.0 | -359 |
| 2850.0 | -360 |
| 2851.0 | -361 |
| 2852.0 | -362 |
| 2853.0 | -363 |
| 2854.0 | -364 |
| 2855.0 | -365 |
| 2856.0 | -361 |
| 2857.0 | -357 |
| 2858.0 | -358 |
| 2859.0 | -359 |
| 2860.0 | -360 |
| 2861.0 | -361 |
| 2862.0 | -362 |
| 2863.0 | -363 |
| 2864.0 | -364 |
| 2865.0 | -365 |
| 2866.0 | -366 |
| 2867.0 | -362 |
| 2868.0 | -363 |
| 2869.0 | -364 |
| 2870.0 | -365 |
| 2871.0 | -366 |
| 2872.0 | -367 |
| 2873.0 | -368 |
| 2874.0 | -369 |
| 2875.0 | -370 |
| 2876.0 | -366 |
| 2877.0 | -367 |
| 2878.0 | -363 |
| 2879.0 | -364 |
| 2880.0 | -365 |
| 2881.0 | -361 |
| 2882.0 | -362 |
| 2883.0 | -363 |
| 2884.0 | -364 |
| 2885.0 | -360 |
| 2886.0 | -356 |
| 2887.0 | -352 |
| 2888.0 | -348 |
| 2889.0 | -349 |
| 2890.0 | -350 |
| 2891.0 | -351 |
| 2892.0 | -347 |
| 2893.0 | -348 |
| 2894.0 | -349 |
| 2895.0 | -350 |
| 2896.0 | -351 |
| 2897.0 | -352 |
| 2898.0 | -348 |
| 2899.0 | -344 |
| 2900.0 | -345 |
| 2901.0 | -341 |
| 2902.0 | -342 |
| 2903.0 | -343 |
| 2904.0 | -339 |
| 2905.0 | -340 |
| 2906.0 | -341 |
| 2907.0 | -342 |
| 2908.0 | -338 |
| 2909.0 | -334 |
| 2910.0 | -330 |
| 2911.0 | -326 |
| 2912.0 | -327 |
| 2913.0 | -328 |
| 2914.0 | -324 |
| 2915.0 | -325 |
| 2916.0 | -326 |
| 2917.0 | -327 |
| 2918.0 | -328 |
| 2919.0 | -329 |
| 2920.0 | -325 |
| 2921.0 | -326 |
| 2922.0 | -327 |
| 2923.0 | -328 |
| 2924.0 | -329 |
| 2925.0 | -330 |
| 2926.0 | -331 |
| 2927.0 | -332 |
| 2928.0 | -333 |
| 2929.0 | -334 |
| 2930.0 | -330 |
| 2931.0 | -331 |
| 2932.0 | -332 |
| 2933.0 | -333 |
| 2934.0 | -334 |
| 2935.0 | -335 |
| 2936.0 | -336 |
| 2937.0 | -337 |
| 2938.0 | -338 |
| 2939.0 | -339 |
| 2940.0 | -340 |
| 2941.0 | -341 |
| 2942.0 | -342 |
| 2943.0 | -343 |
| 2944.0 | -344 |
| 2945.0 | -345 |
| 2946.0 | -346 |
| 2947.0 | -342 |
| 2948.0 | -343 |
| 2949.0 | -344 |
| 2950.0 | -345 |
| 2951.0 | -346 |
| 2952.0 | -347 |
| 2953.0 | -348 |
| 2954.0 | -349 |
| 2955.0 | -350 |
| 2956.0 | -351 |
| 2957.0 | -352 |
| 2958.0 | -348 |
| 2959.0 | -349 |
| 2960.0 | -350 |
| 2961.0 | -351 |
| 2962.0 | -352 |
| 2963.0 | -353 |
| 2964.0 | -354 |
| 2965.0 | -350 |
| 2966.0 | -351 |
| 2967.0 | -352 |
| 2968.0 | -353 |
| 2969.0 | -354 |
| 2970.0 | -350 |
| 2971.0 | -351 |
| 2972.0 | -347 |
| 2973.0 | -343 |
| 2974.0 | -339 |
| 2975.0 | -340 |
| 2976.0 | -341 |
| 2977.0 | -342 |
| 2978.0 | -343 |
| 2979.0 | -344 |
| 2980.0 | -345 |
| 2981.0 | -346 |
| 2982.0 | -347 |
| 2983.0 | -348 |
| 2984.0 | -349 |
| 2985.0 | -350 |
| 2986.0 | -351 |
| 2987.0 | -352 |
| 2988.0 | -353 |
| 2989.0 | -349 |
| 2990.0 | -345 |
| 2991.0 | -346 |
| 2992.0 | -347 |
| 2993.0 | -348 |
| 2994.0 | -349 |
| 2995.0 | -345 |
| 2996.0 | -341 |
| 2997.0 | -337 |
| 2998.0 | -338 |
| 2999.0 | -339 |
| 3000.0 | -340 |
| 3001.0 | -341 |
| 3002.0 | -342 |
| 3003.0 | -343 |
| 3004.0 | -344 |
| 3005.0 | -345 |
| 3006.0 | -346 |
| 3007.0 | -347 |
| 3008.0 | -348 |
| 3009.0 | -349 |
| 3010.0 | -350 |
| 3011.0 | -351 |
| 3012.0 | -352 |
| 3013.0 | -353 |
| 3014.0 | -354 |
| 3015.0 | -355 |
| 3016.0 | -351 |
| 3017.0 | -352 |
| 3018.0 | -353 |
| 3019.0 | -354 |
| 3020.0 | -355 |
| 3021.0 | -356 |
| 3022.0 | -352 |
| 3023.0 | -353 |
| 3024.0 | -354 |
| 3025.0 | -355 |
| 3026.0 | -356 |
| 3027.0 | -357 |
| 3028.0 | -358 |
| 3029.0 | -359 |
| 3030.0 | -355 |
| 3031.0 | -351 |
| 3032.0 | -352 |
| 3033.0 | -353 |
| 3034.0 | -354 |
| 3035.0 | -350 |
| 3036.0 | -351 |
| 3037.0 | -352 |
| 3038.0 | -353 |
| 3039.0 | -349 |
| 3040.0 | -350 |
| 3041.0 | -346 |
| 3042.0 | -347 |
| 3043.0 | -348 |
| 3044.0 | -349 |
| 3045.0 | -350 |
| 3046.0 | -351 |
| 3047.0 | -352 |
| 3048.0 | -348 |
| 3049.0 | -349 |
| 3050.0 | -345 |
| 3051.0 | -341 |
| 3052.0 | -337 |
| 3053.0 | -338 |
| 3054.0 | -339 |
| 3055.0 | -340 |
| 3056.0 | -336 |
| 3057.0 | -332 |
| 3058.0 | -333 |
| 3059.0 | -334 |
| 3060.0 | -335 |
| 3061.0 | -331 |
| 3062.0 | -327 |
| 3063.0 | -328 |
| 3064.0 | -329 |
| 3065.0 | -330 |
| 3066.0 | -331 |
| 3067.0 | -332 |
| 3068.0 | -333 |
| 3069.0 | -334 |
| 3070.0 | -335 |
| 3071.0 | -336 |
| 3072.0 | -337 |
| 3073.0 | -338 |
| 3074.0 | -339 |
| 3075.0 | -340 |
| 3076.0 | -341 |
| 3077.0 | -342 |
| 3078.0 | -343 |
| 3079.0 | -339 |
| 3080.0 | -340 |
| 3081.0 | -341 |
| 3082.0 | -342 |
| 3083.0 | -343 |
| 3084.0 | -344 |
| 3085.0 | -345 |
| 3086.0 | -346 |
| 3087.0 | -347 |
| 3088.0 | -343 |
| 3089.0 | -344 |
| 3090.0 | -345 |
| 3091.0 | -346 |
| 3092.0 | -347 |
| 3093.0 | -343 |
| 3094.0 | -344 |
| 3095.0 | -340 |
| 3096.0 | -341 |
| 3097.0 | -337 |
| 3098.0 | -338 |
| 3099.0 | -339 |
| 3100.0 | -340 |
| 3101.0 | -336 |
| 3102.0 | -337 |
| 3103.0 | -338 |
| 3104.0 | -339 |
| 3105.0 | -340 |
| 3106.0 | -341 |
| 3107.0 | -342 |
| 3108.0 | -338 |
| 3109.0 | -339 |
| 3110.0 | -340 |
| 3111.0 | -341 |
| 3112.0 | -342 |
| 3113.0 | -343 |
| 3114.0 | -344 |
| 3115.0 | -345 |
| 3116.0 | -341 |
| 3117.0 | -342 |
| 3118.0 | -338 |
| 3119.0 | -339 |
| 3120.0 | -340 |
| 3121.0 | -341 |
| 3122.0 | -342 |
| 3123.0 | -343 |
| 3124.0 | -344 |
| 3125.0 | -345 |
| 3126.0 | -341 |
| 3127.0 | -342 |
| 3128.0 | -343 |
| 3129.0 | -344 |
| 3130.0 | -345 |
| 3131.0 | -346 |
| 3132.0 | -347 |
| 3133.0 | -343 |
| 3134.0 | -344 |
| 3135.0 | -345 |
| 3136.0 | -346 |
| 3137.0 | -347 |
| 3138.0 | -348 |
| 3139.0 | -349 |
| 3140.0 | -350 |
| 3141.0 | -351 |
| 3142.0 | -347 |
| 3143.0 | -348 |
| 3144.0 | -349 |
| 3145.0 | -345 |
| 3146.0 | -346 |
| 3147.0 | -347 |
| 3148.0 | -348 |
| 3149.0 | -349 |
| 3150.0 | -350 |
| 3151.0 | -351 |
| 3152.0 | -352 |
| 3153.0 | -348 |
| 3154.0 | -349 |
| 3155.0 | -350 |
| 3156.0 | -351 |
| 3157.0 | -352 |
| 3158.0 | -353 |
| 3159.0 | -349 |
| 3160.0 | -350 |
| 3161.0 | -351 |
| 3162.0 | -347 |
| 3163.0 | -348 |
| 3164.0 | -349 |
| 3165.0 | -350 |
| 3166.0 | -346 |
| 3167.0 | -342 |
| 3168.0 | -343 |
| 3169.0 | -339 |
| 3170.0 | -340 |
| 3171.0 | -341 |
| 3172.0 | -342 |
| 3173.0 | -338 |
| 3174.0 | -339 |
| 3175.0 | -340 |
| 3176.0 | -341 |
| 3177.0 | -337 |
| 3178.0 | -338 |
| 3179.0 | -339 |
| 3180.0 | -340 |
| 3181.0 | -341 |
| 3182.0 | -342 |
| 3183.0 | -343 |
| 3184.0 | -344 |
| 3185.0 | -345 |
| 3186.0 | -346 |
| 3187.0 | -347 |
| 3188.0 | -348 |
| 3189.0 | -349 |
| 3190.0 | -350 |
| 3191.0 | -351 |
| 3192.0 | -352 |
| 3193.0 | -353 |
| 3194.0 | -354 |
| 3195.0 | -355 |
| 3196.0 | -351 |
| 3197.0 | -352 |
| 3198.0 | -353 |
| 3199.0 | -354 |
| 3200.0 | -355 |
| 3201.0 | -356 |
| 3202.0 | -357 |
| 3203.0 | -358 |
| 3204.0 | -359 |
| 3205.0 | -355 |
| 3206.0 | -356 |
| 3207.0 | -357 |
| 3208.0 | -353 |
| 3209.0 | -349 |
| 3210.0 | -345 |
| 3211.0 | -346 |
| 3212.0 | -347 |
| 3213.0 | -343 |
| 3214.0 | -344 |
| 3215.0 | -345 |
| 3216.0 | -346 |
| 3217.0 | -347 |
| 3218.0 | -348 |
| 3219.0 | -349 |
| 3220.0 | -350 |
| 3221.0 | -351 |
| 3222.0 | -352 |
| 3223.0 | -353 |
| 3224.0 | -354 |
| 3225.0 | -355 |
| 3226.0 | -356 |
| 3227.0 | -352 |
| 3228.0 | -353 |
| 3229.0 | -349 |
| 3230.0 | -350 |
| 3231.0 | -351 |
| 3232.0 | -352 |
| 3233.0 | -353 |
| 3234.0 | -354 |
| 3235.0 | -355 |
| 3236.0 | -356 |
| 3237.0 | -357 |
| 3238.0 | -353 |
| 3239.0 | -354 |
| 3240.0 | -355 |
| 3241.0 | -356 |
| 3242.0 | -357 |
| 3243.0 | -358 |
| 3244.0 | -359 |
| 3245.0 | -360 |
| 3246.0 | -356 |
| 3247.0 | -357 |
| 3248.0 | -358 |
| 3249.0 | -359 |
| 3250.0 | -355 |
| 3251.0 | -356 |
| 3252.0 | -357 |
| 3253.0 | -353 |
| 3254.0 | -354 |
| 3255.0 | -355 |
| 3256.0 | -356 |
| 3257.0 | -357 |
| 3258.0 | -358 |
| 3259.0 | -354 |
| 3260.0 | -355 |
| 3261.0 | -356 |
| 3262.0 | -352 |
| 3263.0 | -353 |
| 3264.0 | -354 |
| 3265.0 | -355 |
| 3266.0 | -356 |
| 3267.0 | -357 |
| 3268.0 | -358 |
| 3269.0 | -359 |
| 3270.0 | -360 |
| 3271.0 | -356 |
| 3272.0 | -357 |
| 3273.0 | -358 |
| 3274.0 | -359 |
| 3275.0 | -360 |
| 3276.0 | -356 |
| 3277.0 | -357 |
| 3278.0 | -358 |
| 3279.0 | -359 |
| 3280.0 | -360 |
| 3281.0 | -361 |
| 3282.0 | -362 |
| 3283.0 | -363 |
| 3284.0 | -364 |
| 3285.0 | -365 |
| 3286.0 | -361 |
| 3287.0 | -362 |
| 3288.0 | -363 |
| 3289.0 | -364 |
| 3290.0 | -365 |
| 3291.0 | -366 |
| 3292.0 | -367 |
| 3293.0 | -368 |
| 3294.0 | -364 |
| 3295.0 | -365 |
| 3296.0 | -361 |
| 3297.0 | -357 |
| 3298.0 | -353 |
| 3299.0 | -354 |
| 3300.0 | -355 |
| 3301.0 | -356 |
| 3302.0 | -357 |
| 3303.0 | -358 |
| 3304.0 | -359 |
| 3305.0 | -360 |
| 3306.0 | -361 |
| 3307.0 | -362 |
| 3308.0 | -363 |
| 3309.0 | -364 |
| 3310.0 | -365 |
| 3311.0 | -366 |
| 3312.0 | -367 |
| 3313.0 | -368 |
| 3314.0 | -364 |
| 3315.0 | -365 |
| 3316.0 | -366 |
| 3317.0 | -367 |
| 3318.0 | -368 |
| 3319.0 | -364 |
| 3320.0 | -365 |
| 3321.0 | -366 |
| 3322.0 | -367 |
| 3323.0 | -363 |
| 3324.0 | -364 |
| 3325.0 | -365 |
| 3326.0 | -366 |
| 3327.0 | -367 |
| 3328.0 | -368 |
| 3329.0 | -369 |
| 3330.0 | -370 |
| 3331.0 | -371 |
| 3332.0 | -372 |
| 3333.0 | -373 |
| 3334.0 | -369 |
| 3335.0 | -370 |
| 3336.0 | -371 |
| 3337.0 | -372 |
| 3338.0 | -373 |
| 3339.0 | -374 |
| 3340.0 | -375 |
| 3341.0 | -371 |
| 3342.0 | -372 |
| 3343.0 | -368 |
| 3344.0 | -369 |
| 3345.0 | -370 |
| 3346.0 | -371 |
| 3347.0 | -372 |
| 3348.0 | -373 |
| 3349.0 | -374 |
| 3350.0 | -370 |
| 3351.0 | -371 |
| 3352.0 | -367 |
| 3353.0 | -368 |
| 3354.0 | -369 |
| 3355.0 | -365 |
| 3356.0 | -366 |
| 3357.0 | -367 |
| 3358.0 | -368 |
| 3359.0 | -369 |
| 3360.0 | -370 |
| 3361.0 | -366 |
| 3362.0 | -367 |
| 3363.0 | -368 |
| 3364.0 | -369 |
| 3365.0 | -370 |
| 3366.0 | -371 |
| 3367.0 | -372 |
| 3368.0 | -373 |
| 3369.0 | -374 |
| 3370.0 | -370 |
| 3371.0 | -371 |
| 3372.0 | -372 |
| 3373.0 | -373 |
| 3374.0 | -374 |
| 3375.0 | -375 |
| 3376.0 | -376 |
| 3377.0 | -372 |
| 3378.0 | -373 |
| 3379.0 | -374 |
| 3380.0 | -375 |
| 3381.0 | -376 |
| 3382.0 | -377 |
| 3383.0 | -378 |
| 3384.0 | -379 |
| 3385.0 | -380 |
| 3386.0 | -376 |
| 3387.0 | -377 |
| 3388.0 | -378 |
| 3389.0 | -379 |
| 3390.0 | -375 |
| 3391.0 | -376 |
| 3392.0 | -377 |
| 3393.0 | -378 |
| 3394.0 | -379 |
| 3395.0 | -375 |
| 3396.0 | -376 |
| 3397.0 | -377 |
| 3398.0 | -373 |
| 3399.0 | -374 |
| 3400.0 | -375 |
| 3401.0 | -376 |
| 3402.0 | -377 |
| 3403.0 | -378 |
| 3404.0 | -374 |
| 3405.0 | -370 |
| 3406.0 | -371 |
| 3407.0 | -372 |
| 3408.0 | -373 |
| 3409.0 | -374 |
| 3410.0 | -375 |
| 3411.0 | -376 |
| 3412.0 | -377 |
| 3413.0 | -378 |
| 3414.0 | -379 |
| 3415.0 | -380 |
| 3416.0 | -381 |
| 3417.0 | -382 |
| 3418.0 | -383 |
| 3419.0 | -384 |
| 3420.0 | -385 |
| 3421.0 | -386 |
| 3422.0 | -387 |
| 3423.0 | -388 |
| 3424.0 | -389 |
| 3425.0 | -390 |
| 3426.0 | -391 |
| 3427.0 | -392 |
| 3428.0 | -393 |
| 3429.0 | -394 |
| 3430.0 | -395 |
| 3431.0 | -396 |
| 3432.0 | -397 |
| 3433.0 | -398 |
| 3434.0 | -399 |
| 3435.0 | -395 |
| 3436.0 | -391 |
| 3437.0 | -392 |
| 3438.0 | -393 |
| 3439.0 | -394 |
| 3440.0 | -395 |
| 3441.0 | -396 |
| 3442.0 | -397 |
| 3443.0 | -398 |
| 3444.0 | -399 |
| 3445.0 | -400 |
| 3446.0 | -396 |
| 3447.0 | -392 |
| 3448.0 | -393 |
| 3449.0 | -394 |
| 3450.0 | -395 |
| 3451.0 | -391 |
| 3452.0 | -387 |
| 3453.0 | -388 |
| 3454.0 | -389 |
| 3455.0 | -390 |
| 3456.0 | -391 |
| 3457.0 | -392 |
| 3458.0 | -393 |
| 3459.0 | -394 |
| 3460.0 | -390 |
| 3461.0 | -386 |
| 3462.0 | -387 |
| 3463.0 | -388 |
| 3464.0 | -384 |
| 3465.0 | -380 |
| 3466.0 | -381 |
| 3467.0 | -382 |
| 3468.0 | -383 |
| 3469.0 | -379 |
| 3470.0 | -380 |
| 3471.0 | -381 |
| 3472.0 | -382 |
| 3473.0 | -383 |
| 3474.0 | -384 |
| 3475.0 | -385 |
| 3476.0 | -386 |
| 3477.0 | -387 |
| 3478.0 | -388 |
| 3479.0 | -389 |
| 3480.0 | -390 |
| 3481.0 | -391 |
| 3482.0 | -392 |
| 3483.0 | -393 |
| 3484.0 | -394 |
| 3485.0 | -390 |
| 3486.0 | -391 |
| 3487.0 | -387 |
| 3488.0 | -388 |
| 3489.0 | -389 |
| 3490.0 | -390 |
| 3491.0 | -386 |
| 3492.0 | -387 |
| 3493.0 | -388 |
| 3494.0 | -389 |
| 3495.0 | -385 |
| 3496.0 | -381 |
| 3497.0 | -382 |
| 3498.0 | -383 |
| 3499.0 | -384 |
| 3500.0 | -380 |
| 3501.0 | -381 |
| 3502.0 | -377 |
| 3503.0 | -378 |
| 3504.0 | -379 |
| 3505.0 | -380 |
| 3506.0 | -381 |
| 3507.0 | -382 |
| 3508.0 | -383 |
| 3509.0 | -384 |
| 3510.0 | -385 |
| 3511.0 | -386 |
| 3512.0 | -387 |
| 3513.0 | -388 |
| 3514.0 | -389 |
| 3515.0 | -390 |
| 3516.0 | -386 |
| 3517.0 | -387 |
| 3518.0 | -383 |
| 3519.0 | -379 |
| 3520.0 | -380 |
| 3521.0 | -381 |
| 3522.0 | -382 |
| 3523.0 | -378 |
| 3524.0 | -374 |
| 3525.0 | -375 |
| 3526.0 | -376 |
| 3527.0 | -372 |
| 3528.0 | -368 |
| 3529.0 | -364 |
| 3530.0 | -365 |
| 3531.0 | -366 |
| 3532.0 | -367 |
| 3533.0 | -368 |
| 3534.0 | -369 |
| 3535.0 | -370 |
| 3536.0 | -371 |
| 3537.0 | -372 |
| 3538.0 | -373 |
| 3539.0 | -369 |
| 3540.0 | -365 |
| 3541.0 | -361 |
| 3542.0 | -357 |
| 3543.0 | -353 |
| 3544.0 | -354 |
| 3545.0 | -355 |
| 3546.0 | -356 |
| 3547.0 | -357 |
| 3548.0 | -353 |
| 3549.0 | -349 |
| 3550.0 | -350 |
| 3551.0 | -351 |
| 3552.0 | -352 |
| 3553.0 | -353 |
| 3554.0 | -349 |
| 3555.0 | -350 |
| 3556.0 | -351 |
| 3557.0 | -347 |
| 3558.0 | -348 |
| 3559.0 | -349 |
| 3560.0 | -350 |
| 3561.0 | -351 |
| 3562.0 | -352 |
| 3563.0 | -353 |
| 3564.0 | -354 |
| 3565.0 | -355 |
| 3566.0 | -356 |
| 3567.0 | -357 |
| 3568.0 | -358 |
| 3569.0 | -359 |
| 3570.0 | -355 |
| 3571.0 | -351 |
| 3572.0 | -352 |
| 3573.0 | -353 |
| 3574.0 | -354 |
| 3575.0 | -355 |
| 3576.0 | -356 |
| 3577.0 | -357 |
| 3578.0 | -358 |
| 3579.0 | -359 |
| 3580.0 | -355 |
| 3581.0 | -356 |
| 3582.0 | -357 |
| 3583.0 | -358 |
| 3584.0 | -359 |
| 3585.0 | -360 |
| 3586.0 | -361 |
| 3587.0 | -362 |
| 3588.0 | -363 |
| 3589.0 | -364 |
| 3590.0 | -365 |
| 3591.0 | -366 |
| 3592.0 | -367 |
| 3593.0 | -368 |
| 3594.0 | -369 |
| 3595.0 | -370 |
| 3596.0 | -366 |
| 3597.0 | -367 |
| 3598.0 | -363 |
| 3599.0 | -359 |
| 3600.0 | -360 |